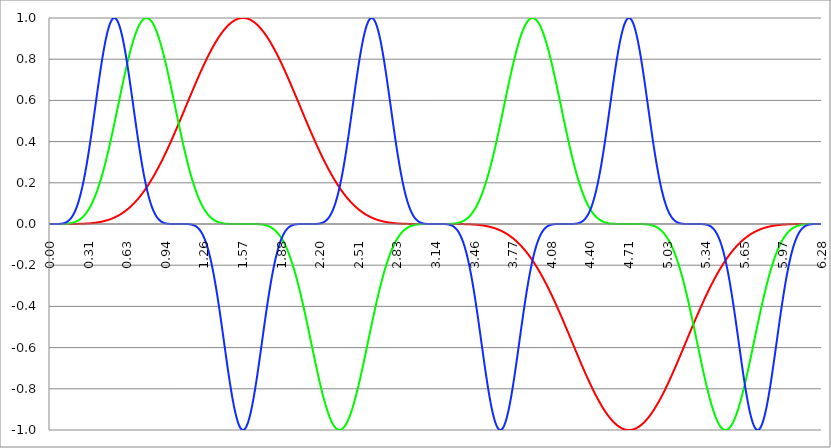
| Category | Series 1 | Series 0 | Series 2 |
|---|---|---|---|
| 0.0 | 0 | 0 | 0 |
| 0.00314159265358979 | 0 | 0 | 0 |
| 0.00628318530717958 | 0 | 0 | 0 |
| 0.00942477796076938 | 0 | 0 | 0 |
| 0.0125663706143592 | 0 | 0 | 0 |
| 0.015707963267949 | 0 | 0 | 0 |
| 0.0188495559215388 | 0 | 0 | 0 |
| 0.0219911485751285 | 0 | 0 | 0 |
| 0.0251327412287183 | 0 | 0 | 0 |
| 0.0282743338823081 | 0 | 0 | 0 |
| 0.0314159265358979 | 0 | 0 | 0 |
| 0.0345575191894877 | 0 | 0 | 0 |
| 0.0376991118430775 | 0 | 0 | 0 |
| 0.0408407044966673 | 0 | 0 | 0 |
| 0.0439822971502571 | 0 | 0 | 0 |
| 0.0471238898038469 | 0 | 0 | 0 |
| 0.0502654824574367 | 0 | 0 | 0 |
| 0.0534070751110265 | 0 | 0 | 0 |
| 0.0565486677646163 | 0 | 0 | 0 |
| 0.059690260418206 | 0 | 0 | 0 |
| 0.0628318530717958 | 0 | 0 | 0 |
| 0.0659734457253856 | 0 | 0 | 0 |
| 0.0691150383789754 | 0 | 0 | 0 |
| 0.0722566310325652 | 0 | 0 | 0 |
| 0.075398223686155 | 0 | 0 | 0.001 |
| 0.0785398163397448 | 0 | 0 | 0.001 |
| 0.0816814089933346 | 0 | 0 | 0.001 |
| 0.0848230016469244 | 0 | 0 | 0.001 |
| 0.0879645943005142 | 0 | 0 | 0.001 |
| 0.091106186954104 | 0 | 0 | 0.001 |
| 0.0942477796076937 | 0 | 0 | 0.002 |
| 0.0973893722612835 | 0 | 0 | 0.002 |
| 0.100530964914873 | 0 | 0 | 0.002 |
| 0.103672557568463 | 0 | 0 | 0.003 |
| 0.106814150222053 | 0 | 0 | 0.003 |
| 0.109955742875643 | 0 | 0 | 0.004 |
| 0.113097335529233 | 0 | 0.001 | 0.004 |
| 0.116238928182822 | 0 | 0.001 | 0.005 |
| 0.119380520836412 | 0 | 0.001 | 0.005 |
| 0.122522113490002 | 0 | 0.001 | 0.006 |
| 0.125663706143592 | 0 | 0.001 | 0.007 |
| 0.128805298797181 | 0 | 0.001 | 0.008 |
| 0.131946891450771 | 0 | 0.001 | 0.009 |
| 0.135088484104361 | 0 | 0.001 | 0.01 |
| 0.138230076757951 | 0 | 0.002 | 0.011 |
| 0.141371669411541 | 0 | 0.002 | 0.012 |
| 0.14451326206513 | 0 | 0.002 | 0.013 |
| 0.14765485471872 | 0 | 0.002 | 0.014 |
| 0.15079644737231 | 0 | 0.002 | 0.016 |
| 0.1539380400259 | 0 | 0.003 | 0.018 |
| 0.15707963267949 | 0 | 0.003 | 0.019 |
| 0.160221225333079 | 0 | 0.003 | 0.021 |
| 0.163362817986669 | 0 | 0.003 | 0.023 |
| 0.166504410640259 | 0 | 0.004 | 0.025 |
| 0.169646003293849 | 0 | 0.004 | 0.027 |
| 0.172787595947439 | 0 | 0.004 | 0.03 |
| 0.175929188601028 | 0 | 0.005 | 0.032 |
| 0.179070781254618 | 0 | 0.005 | 0.035 |
| 0.182212373908208 | 0 | 0.006 | 0.038 |
| 0.185353966561798 | 0 | 0.006 | 0.041 |
| 0.188495559215388 | 0 | 0.007 | 0.044 |
| 0.191637151868977 | 0 | 0.007 | 0.048 |
| 0.194778744522567 | 0 | 0.008 | 0.051 |
| 0.197920337176157 | 0 | 0.009 | 0.055 |
| 0.201061929829747 | 0 | 0.009 | 0.059 |
| 0.204203522483336 | 0 | 0.01 | 0.063 |
| 0.207345115136926 | 0 | 0.011 | 0.067 |
| 0.210486707790516 | 0 | 0.011 | 0.072 |
| 0.213628300444106 | 0 | 0.012 | 0.076 |
| 0.216769893097696 | 0 | 0.013 | 0.081 |
| 0.219911485751285 | 0 | 0.014 | 0.086 |
| 0.223053078404875 | 0.001 | 0.015 | 0.092 |
| 0.226194671058465 | 0.001 | 0.016 | 0.097 |
| 0.229336263712055 | 0.001 | 0.017 | 0.103 |
| 0.232477856365645 | 0.001 | 0.018 | 0.109 |
| 0.235619449019234 | 0.001 | 0.019 | 0.116 |
| 0.238761041672824 | 0.001 | 0.021 | 0.122 |
| 0.241902634326414 | 0.001 | 0.022 | 0.129 |
| 0.245044226980004 | 0.001 | 0.023 | 0.136 |
| 0.248185819633594 | 0.001 | 0.024 | 0.143 |
| 0.251327412287183 | 0.001 | 0.026 | 0.15 |
| 0.254469004940773 | 0.001 | 0.027 | 0.158 |
| 0.257610597594363 | 0.001 | 0.029 | 0.166 |
| 0.260752190247953 | 0.001 | 0.031 | 0.174 |
| 0.263893782901543 | 0.001 | 0.032 | 0.182 |
| 0.267035375555132 | 0.001 | 0.034 | 0.191 |
| 0.270176968208722 | 0.001 | 0.036 | 0.2 |
| 0.273318560862312 | 0.001 | 0.038 | 0.209 |
| 0.276460153515902 | 0.002 | 0.04 | 0.218 |
| 0.279601746169492 | 0.002 | 0.042 | 0.228 |
| 0.282743338823082 | 0.002 | 0.044 | 0.237 |
| 0.285884931476671 | 0.002 | 0.046 | 0.247 |
| 0.289026524130261 | 0.002 | 0.049 | 0.258 |
| 0.292168116783851 | 0.002 | 0.051 | 0.268 |
| 0.295309709437441 | 0.002 | 0.054 | 0.279 |
| 0.298451302091031 | 0.002 | 0.056 | 0.29 |
| 0.30159289474462 | 0.002 | 0.059 | 0.301 |
| 0.30473448739821 | 0.002 | 0.061 | 0.312 |
| 0.3078760800518 | 0.003 | 0.064 | 0.323 |
| 0.31101767270539 | 0.003 | 0.067 | 0.335 |
| 0.31415926535898 | 0.003 | 0.07 | 0.347 |
| 0.31730085801257 | 0.003 | 0.073 | 0.359 |
| 0.320442450666159 | 0.003 | 0.076 | 0.371 |
| 0.323584043319749 | 0.003 | 0.08 | 0.383 |
| 0.326725635973339 | 0.003 | 0.083 | 0.395 |
| 0.329867228626929 | 0.004 | 0.086 | 0.408 |
| 0.333008821280519 | 0.004 | 0.09 | 0.421 |
| 0.336150413934108 | 0.004 | 0.094 | 0.433 |
| 0.339292006587698 | 0.004 | 0.097 | 0.446 |
| 0.342433599241288 | 0.004 | 0.101 | 0.459 |
| 0.345575191894878 | 0.004 | 0.105 | 0.472 |
| 0.348716784548468 | 0.005 | 0.109 | 0.486 |
| 0.351858377202058 | 0.005 | 0.113 | 0.499 |
| 0.354999969855647 | 0.005 | 0.118 | 0.512 |
| 0.358141562509237 | 0.005 | 0.122 | 0.526 |
| 0.361283155162827 | 0.006 | 0.126 | 0.539 |
| 0.364424747816417 | 0.006 | 0.131 | 0.553 |
| 0.367566340470007 | 0.006 | 0.136 | 0.566 |
| 0.370707933123597 | 0.006 | 0.14 | 0.58 |
| 0.373849525777186 | 0.006 | 0.145 | 0.593 |
| 0.376991118430776 | 0.007 | 0.15 | 0.606 |
| 0.380132711084366 | 0.007 | 0.155 | 0.62 |
| 0.383274303737956 | 0.007 | 0.161 | 0.633 |
| 0.386415896391546 | 0.008 | 0.166 | 0.647 |
| 0.389557489045135 | 0.008 | 0.171 | 0.66 |
| 0.392699081698725 | 0.008 | 0.177 | 0.673 |
| 0.395840674352315 | 0.009 | 0.182 | 0.686 |
| 0.398982267005905 | 0.009 | 0.188 | 0.699 |
| 0.402123859659495 | 0.009 | 0.194 | 0.712 |
| 0.405265452313085 | 0.01 | 0.2 | 0.725 |
| 0.408407044966674 | 0.01 | 0.206 | 0.737 |
| 0.411548637620264 | 0.01 | 0.212 | 0.75 |
| 0.414690230273854 | 0.011 | 0.218 | 0.762 |
| 0.417831822927444 | 0.011 | 0.225 | 0.774 |
| 0.420973415581034 | 0.011 | 0.231 | 0.786 |
| 0.424115008234623 | 0.012 | 0.237 | 0.798 |
| 0.427256600888213 | 0.012 | 0.244 | 0.809 |
| 0.430398193541803 | 0.013 | 0.251 | 0.82 |
| 0.433539786195393 | 0.013 | 0.258 | 0.831 |
| 0.436681378848983 | 0.014 | 0.265 | 0.842 |
| 0.439822971502573 | 0.014 | 0.272 | 0.852 |
| 0.442964564156162 | 0.014 | 0.279 | 0.863 |
| 0.446106156809752 | 0.015 | 0.286 | 0.873 |
| 0.449247749463342 | 0.015 | 0.293 | 0.882 |
| 0.452389342116932 | 0.016 | 0.301 | 0.891 |
| 0.455530934770522 | 0.016 | 0.308 | 0.9 |
| 0.458672527424111 | 0.017 | 0.316 | 0.909 |
| 0.461814120077701 | 0.018 | 0.323 | 0.917 |
| 0.464955712731291 | 0.018 | 0.331 | 0.925 |
| 0.468097305384881 | 0.019 | 0.339 | 0.933 |
| 0.471238898038471 | 0.019 | 0.347 | 0.94 |
| 0.474380490692061 | 0.02 | 0.355 | 0.947 |
| 0.47752208334565 | 0.021 | 0.363 | 0.953 |
| 0.48066367599924 | 0.021 | 0.371 | 0.959 |
| 0.48380526865283 | 0.022 | 0.379 | 0.965 |
| 0.48694686130642 | 0.022 | 0.387 | 0.97 |
| 0.49008845396001 | 0.023 | 0.395 | 0.975 |
| 0.493230046613599 | 0.024 | 0.404 | 0.979 |
| 0.496371639267189 | 0.024 | 0.412 | 0.983 |
| 0.499513231920779 | 0.025 | 0.421 | 0.987 |
| 0.502654824574369 | 0.026 | 0.429 | 0.99 |
| 0.505796417227959 | 0.027 | 0.438 | 0.993 |
| 0.508938009881549 | 0.027 | 0.446 | 0.995 |
| 0.512079602535138 | 0.028 | 0.455 | 0.997 |
| 0.515221195188728 | 0.029 | 0.464 | 0.998 |
| 0.518362787842318 | 0.03 | 0.472 | 0.999 |
| 0.521504380495908 | 0.031 | 0.481 | 1 |
| 0.524645973149498 | 0.032 | 0.49 | 1 |
| 0.527787565803087 | 0.032 | 0.499 | 1 |
| 0.530929158456677 | 0.033 | 0.508 | 0.999 |
| 0.534070751110267 | 0.034 | 0.517 | 0.998 |
| 0.537212343763857 | 0.035 | 0.526 | 0.996 |
| 0.540353936417447 | 0.036 | 0.535 | 0.994 |
| 0.543495529071037 | 0.037 | 0.544 | 0.991 |
| 0.546637121724626 | 0.038 | 0.553 | 0.988 |
| 0.549778714378216 | 0.039 | 0.562 | 0.985 |
| 0.552920307031806 | 0.04 | 0.571 | 0.981 |
| 0.556061899685396 | 0.041 | 0.58 | 0.977 |
| 0.559203492338986 | 0.042 | 0.589 | 0.972 |
| 0.562345084992576 | 0.043 | 0.598 | 0.967 |
| 0.565486677646165 | 0.044 | 0.606 | 0.961 |
| 0.568628270299755 | 0.045 | 0.615 | 0.955 |
| 0.571769862953345 | 0.046 | 0.624 | 0.949 |
| 0.574911455606935 | 0.048 | 0.633 | 0.942 |
| 0.578053048260525 | 0.049 | 0.642 | 0.935 |
| 0.581194640914114 | 0.05 | 0.651 | 0.928 |
| 0.584336233567704 | 0.051 | 0.66 | 0.92 |
| 0.587477826221294 | 0.052 | 0.669 | 0.912 |
| 0.590619418874884 | 0.054 | 0.677 | 0.903 |
| 0.593761011528474 | 0.055 | 0.686 | 0.894 |
| 0.596902604182064 | 0.056 | 0.695 | 0.885 |
| 0.600044196835653 | 0.057 | 0.703 | 0.876 |
| 0.603185789489243 | 0.059 | 0.712 | 0.866 |
| 0.606327382142833 | 0.06 | 0.721 | 0.856 |
| 0.609468974796423 | 0.061 | 0.729 | 0.846 |
| 0.612610567450013 | 0.063 | 0.737 | 0.835 |
| 0.615752160103602 | 0.064 | 0.746 | 0.824 |
| 0.618893752757192 | 0.066 | 0.754 | 0.813 |
| 0.622035345410782 | 0.067 | 0.762 | 0.802 |
| 0.625176938064372 | 0.069 | 0.77 | 0.79 |
| 0.628318530717962 | 0.07 | 0.778 | 0.778 |
| 0.631460123371551 | 0.072 | 0.786 | 0.766 |
| 0.634601716025141 | 0.073 | 0.794 | 0.754 |
| 0.637743308678731 | 0.075 | 0.802 | 0.742 |
| 0.640884901332321 | 0.076 | 0.809 | 0.729 |
| 0.644026493985911 | 0.078 | 0.817 | 0.716 |
| 0.647168086639501 | 0.08 | 0.824 | 0.703 |
| 0.65030967929309 | 0.081 | 0.831 | 0.691 |
| 0.65345127194668 | 0.083 | 0.838 | 0.677 |
| 0.65659286460027 | 0.085 | 0.846 | 0.664 |
| 0.65973445725386 | 0.086 | 0.852 | 0.651 |
| 0.66287604990745 | 0.088 | 0.859 | 0.638 |
| 0.666017642561039 | 0.09 | 0.866 | 0.624 |
| 0.669159235214629 | 0.092 | 0.873 | 0.611 |
| 0.672300827868219 | 0.094 | 0.879 | 0.598 |
| 0.675442420521809 | 0.096 | 0.885 | 0.584 |
| 0.678584013175399 | 0.097 | 0.891 | 0.571 |
| 0.681725605828989 | 0.099 | 0.897 | 0.557 |
| 0.684867198482578 | 0.101 | 0.903 | 0.544 |
| 0.688008791136168 | 0.103 | 0.909 | 0.53 |
| 0.691150383789758 | 0.105 | 0.915 | 0.517 |
| 0.694291976443348 | 0.107 | 0.92 | 0.503 |
| 0.697433569096938 | 0.109 | 0.925 | 0.49 |
| 0.700575161750528 | 0.111 | 0.93 | 0.477 |
| 0.703716754404117 | 0.113 | 0.935 | 0.464 |
| 0.706858347057707 | 0.116 | 0.94 | 0.451 |
| 0.709999939711297 | 0.118 | 0.945 | 0.438 |
| 0.713141532364887 | 0.12 | 0.949 | 0.425 |
| 0.716283125018477 | 0.122 | 0.953 | 0.412 |
| 0.719424717672066 | 0.124 | 0.957 | 0.399 |
| 0.722566310325656 | 0.126 | 0.961 | 0.387 |
| 0.725707902979246 | 0.129 | 0.965 | 0.375 |
| 0.728849495632836 | 0.131 | 0.968 | 0.363 |
| 0.731991088286426 | 0.133 | 0.972 | 0.351 |
| 0.735132680940016 | 0.136 | 0.975 | 0.339 |
| 0.738274273593605 | 0.138 | 0.978 | 0.327 |
| 0.741415866247195 | 0.14 | 0.981 | 0.316 |
| 0.744557458900785 | 0.143 | 0.983 | 0.304 |
| 0.747699051554375 | 0.145 | 0.986 | 0.293 |
| 0.750840644207965 | 0.148 | 0.988 | 0.282 |
| 0.753982236861554 | 0.15 | 0.99 | 0.272 |
| 0.757123829515144 | 0.153 | 0.992 | 0.261 |
| 0.760265422168734 | 0.155 | 0.994 | 0.251 |
| 0.763407014822324 | 0.158 | 0.995 | 0.241 |
| 0.766548607475914 | 0.161 | 0.996 | 0.231 |
| 0.769690200129504 | 0.163 | 0.998 | 0.221 |
| 0.772831792783093 | 0.166 | 0.998 | 0.212 |
| 0.775973385436683 | 0.169 | 0.999 | 0.203 |
| 0.779114978090273 | 0.171 | 1 | 0.194 |
| 0.782256570743863 | 0.174 | 1 | 0.185 |
| 0.785398163397453 | 0.177 | 1 | 0.177 |
| 0.788539756051042 | 0.18 | 1 | 0.169 |
| 0.791681348704632 | 0.182 | 1 | 0.161 |
| 0.794822941358222 | 0.185 | 0.999 | 0.153 |
| 0.797964534011812 | 0.188 | 0.998 | 0.145 |
| 0.801106126665402 | 0.191 | 0.998 | 0.138 |
| 0.804247719318992 | 0.194 | 0.996 | 0.131 |
| 0.807389311972581 | 0.197 | 0.995 | 0.124 |
| 0.810530904626171 | 0.2 | 0.994 | 0.118 |
| 0.813672497279761 | 0.203 | 0.992 | 0.111 |
| 0.816814089933351 | 0.206 | 0.99 | 0.105 |
| 0.819955682586941 | 0.209 | 0.988 | 0.099 |
| 0.823097275240531 | 0.212 | 0.986 | 0.094 |
| 0.82623886789412 | 0.215 | 0.983 | 0.088 |
| 0.82938046054771 | 0.218 | 0.981 | 0.083 |
| 0.8325220532013 | 0.221 | 0.978 | 0.078 |
| 0.83566364585489 | 0.225 | 0.975 | 0.073 |
| 0.83880523850848 | 0.228 | 0.972 | 0.069 |
| 0.841946831162069 | 0.231 | 0.968 | 0.064 |
| 0.845088423815659 | 0.234 | 0.965 | 0.06 |
| 0.848230016469249 | 0.237 | 0.961 | 0.056 |
| 0.851371609122839 | 0.241 | 0.957 | 0.052 |
| 0.854513201776429 | 0.244 | 0.953 | 0.049 |
| 0.857654794430019 | 0.247 | 0.949 | 0.045 |
| 0.860796387083608 | 0.251 | 0.945 | 0.042 |
| 0.863937979737198 | 0.254 | 0.94 | 0.039 |
| 0.867079572390788 | 0.258 | 0.935 | 0.036 |
| 0.870221165044378 | 0.261 | 0.93 | 0.033 |
| 0.873362757697968 | 0.265 | 0.925 | 0.031 |
| 0.876504350351557 | 0.268 | 0.92 | 0.028 |
| 0.879645943005147 | 0.272 | 0.915 | 0.026 |
| 0.882787535658737 | 0.275 | 0.909 | 0.024 |
| 0.885929128312327 | 0.279 | 0.903 | 0.022 |
| 0.889070720965917 | 0.282 | 0.897 | 0.02 |
| 0.892212313619507 | 0.286 | 0.891 | 0.018 |
| 0.895353906273096 | 0.29 | 0.885 | 0.016 |
| 0.898495498926686 | 0.293 | 0.879 | 0.015 |
| 0.901637091580276 | 0.297 | 0.873 | 0.014 |
| 0.904778684233866 | 0.301 | 0.866 | 0.012 |
| 0.907920276887456 | 0.304 | 0.859 | 0.011 |
| 0.911061869541045 | 0.308 | 0.852 | 0.01 |
| 0.914203462194635 | 0.312 | 0.846 | 0.009 |
| 0.917345054848225 | 0.316 | 0.838 | 0.008 |
| 0.920486647501815 | 0.319 | 0.831 | 0.007 |
| 0.923628240155405 | 0.323 | 0.824 | 0.006 |
| 0.926769832808995 | 0.327 | 0.817 | 0.006 |
| 0.929911425462584 | 0.331 | 0.809 | 0.005 |
| 0.933053018116174 | 0.335 | 0.802 | 0.004 |
| 0.936194610769764 | 0.339 | 0.794 | 0.004 |
| 0.939336203423354 | 0.343 | 0.786 | 0.003 |
| 0.942477796076944 | 0.347 | 0.778 | 0.003 |
| 0.945619388730533 | 0.351 | 0.77 | 0.002 |
| 0.948760981384123 | 0.355 | 0.762 | 0.002 |
| 0.951902574037713 | 0.359 | 0.754 | 0.002 |
| 0.955044166691303 | 0.363 | 0.746 | 0.002 |
| 0.958185759344893 | 0.367 | 0.737 | 0.001 |
| 0.961327351998483 | 0.371 | 0.729 | 0.001 |
| 0.964468944652072 | 0.375 | 0.721 | 0.001 |
| 0.967610537305662 | 0.379 | 0.712 | 0.001 |
| 0.970752129959252 | 0.383 | 0.703 | 0.001 |
| 0.973893722612842 | 0.387 | 0.695 | 0 |
| 0.977035315266432 | 0.391 | 0.686 | 0 |
| 0.980176907920022 | 0.395 | 0.677 | 0 |
| 0.983318500573611 | 0.399 | 0.669 | 0 |
| 0.986460093227201 | 0.404 | 0.66 | 0 |
| 0.989601685880791 | 0.408 | 0.651 | 0 |
| 0.992743278534381 | 0.412 | 0.642 | 0 |
| 0.995884871187971 | 0.416 | 0.633 | 0 |
| 0.99902646384156 | 0.421 | 0.624 | 0 |
| 1.00216805649515 | 0.425 | 0.615 | 0 |
| 1.00530964914874 | 0.429 | 0.606 | 0 |
| 1.00845124180233 | 0.433 | 0.598 | 0 |
| 1.01159283445592 | 0.438 | 0.589 | 0 |
| 1.01473442710951 | 0.442 | 0.58 | 0 |
| 1.017876019763099 | 0.446 | 0.571 | 0 |
| 1.021017612416689 | 0.451 | 0.562 | 0 |
| 1.02415920507028 | 0.455 | 0.553 | 0 |
| 1.027300797723869 | 0.459 | 0.544 | 0 |
| 1.030442390377459 | 0.464 | 0.535 | 0 |
| 1.033583983031048 | 0.468 | 0.526 | 0 |
| 1.036725575684638 | 0.472 | 0.517 | 0 |
| 1.039867168338228 | 0.477 | 0.508 | 0 |
| 1.043008760991818 | 0.481 | 0.499 | 0 |
| 1.046150353645408 | 0.486 | 0.49 | 0 |
| 1.049291946298998 | 0.49 | 0.481 | 0 |
| 1.052433538952587 | 0.495 | 0.472 | 0 |
| 1.055575131606177 | 0.499 | 0.464 | 0 |
| 1.058716724259767 | 0.503 | 0.455 | 0 |
| 1.061858316913357 | 0.508 | 0.446 | 0 |
| 1.064999909566947 | 0.512 | 0.438 | 0 |
| 1.068141502220536 | 0.517 | 0.429 | 0 |
| 1.071283094874126 | 0.521 | 0.421 | 0 |
| 1.074424687527716 | 0.526 | 0.412 | 0 |
| 1.077566280181306 | 0.53 | 0.404 | 0 |
| 1.080707872834896 | 0.535 | 0.395 | 0 |
| 1.083849465488486 | 0.539 | 0.387 | 0 |
| 1.086991058142075 | 0.544 | 0.379 | 0 |
| 1.090132650795665 | 0.548 | 0.371 | 0 |
| 1.093274243449255 | 0.553 | 0.363 | 0 |
| 1.096415836102845 | 0.557 | 0.355 | 0 |
| 1.099557428756435 | 0.562 | 0.347 | 0 |
| 1.102699021410025 | 0.566 | 0.339 | 0 |
| 1.105840614063614 | 0.571 | 0.331 | 0 |
| 1.108982206717204 | 0.575 | 0.323 | 0 |
| 1.112123799370794 | 0.58 | 0.316 | 0 |
| 1.115265392024384 | 0.584 | 0.308 | 0 |
| 1.118406984677974 | 0.589 | 0.301 | 0 |
| 1.121548577331563 | 0.593 | 0.293 | -0.001 |
| 1.124690169985153 | 0.598 | 0.286 | -0.001 |
| 1.127831762638743 | 0.602 | 0.279 | -0.001 |
| 1.130973355292333 | 0.606 | 0.272 | -0.001 |
| 1.134114947945923 | 0.611 | 0.265 | -0.001 |
| 1.137256540599513 | 0.615 | 0.258 | -0.001 |
| 1.140398133253102 | 0.62 | 0.251 | -0.002 |
| 1.143539725906692 | 0.624 | 0.244 | -0.002 |
| 1.146681318560282 | 0.629 | 0.237 | -0.002 |
| 1.149822911213872 | 0.633 | 0.231 | -0.003 |
| 1.152964503867462 | 0.638 | 0.225 | -0.003 |
| 1.156106096521051 | 0.642 | 0.218 | -0.003 |
| 1.159247689174641 | 0.647 | 0.212 | -0.004 |
| 1.162389281828231 | 0.651 | 0.206 | -0.004 |
| 1.165530874481821 | 0.655 | 0.2 | -0.005 |
| 1.168672467135411 | 0.66 | 0.194 | -0.006 |
| 1.171814059789001 | 0.664 | 0.188 | -0.006 |
| 1.17495565244259 | 0.669 | 0.182 | -0.007 |
| 1.17809724509618 | 0.673 | 0.177 | -0.008 |
| 1.18123883774977 | 0.677 | 0.171 | -0.009 |
| 1.18438043040336 | 0.682 | 0.166 | -0.01 |
| 1.18752202305695 | 0.686 | 0.161 | -0.011 |
| 1.190663615710539 | 0.691 | 0.155 | -0.013 |
| 1.193805208364129 | 0.695 | 0.15 | -0.014 |
| 1.19694680101772 | 0.699 | 0.145 | -0.015 |
| 1.200088393671309 | 0.703 | 0.14 | -0.017 |
| 1.203229986324899 | 0.708 | 0.136 | -0.019 |
| 1.206371578978489 | 0.712 | 0.131 | -0.021 |
| 1.209513171632078 | 0.716 | 0.126 | -0.022 |
| 1.212654764285668 | 0.721 | 0.122 | -0.024 |
| 1.215796356939258 | 0.725 | 0.118 | -0.027 |
| 1.218937949592848 | 0.729 | 0.113 | -0.029 |
| 1.222079542246438 | 0.733 | 0.109 | -0.032 |
| 1.225221134900027 | 0.737 | 0.105 | -0.034 |
| 1.228362727553617 | 0.742 | 0.101 | -0.037 |
| 1.231504320207207 | 0.746 | 0.097 | -0.04 |
| 1.234645912860797 | 0.75 | 0.094 | -0.043 |
| 1.237787505514387 | 0.754 | 0.09 | -0.046 |
| 1.240929098167977 | 0.758 | 0.086 | -0.05 |
| 1.244070690821566 | 0.762 | 0.083 | -0.054 |
| 1.247212283475156 | 0.766 | 0.08 | -0.057 |
| 1.250353876128746 | 0.77 | 0.076 | -0.061 |
| 1.253495468782336 | 0.774 | 0.073 | -0.066 |
| 1.256637061435926 | 0.778 | 0.07 | -0.07 |
| 1.259778654089515 | 0.782 | 0.067 | -0.075 |
| 1.262920246743105 | 0.786 | 0.064 | -0.08 |
| 1.266061839396695 | 0.79 | 0.061 | -0.085 |
| 1.269203432050285 | 0.794 | 0.059 | -0.09 |
| 1.272345024703875 | 0.798 | 0.056 | -0.096 |
| 1.275486617357465 | 0.802 | 0.054 | -0.101 |
| 1.278628210011054 | 0.805 | 0.051 | -0.107 |
| 1.281769802664644 | 0.809 | 0.049 | -0.113 |
| 1.284911395318234 | 0.813 | 0.046 | -0.12 |
| 1.288052987971824 | 0.817 | 0.044 | -0.126 |
| 1.291194580625414 | 0.82 | 0.042 | -0.133 |
| 1.294336173279003 | 0.824 | 0.04 | -0.14 |
| 1.297477765932593 | 0.828 | 0.038 | -0.148 |
| 1.300619358586183 | 0.831 | 0.036 | -0.155 |
| 1.303760951239773 | 0.835 | 0.034 | -0.163 |
| 1.306902543893363 | 0.838 | 0.032 | -0.171 |
| 1.310044136546953 | 0.842 | 0.031 | -0.18 |
| 1.313185729200542 | 0.846 | 0.029 | -0.188 |
| 1.316327321854132 | 0.849 | 0.027 | -0.197 |
| 1.319468914507722 | 0.852 | 0.026 | -0.206 |
| 1.322610507161312 | 0.856 | 0.024 | -0.215 |
| 1.325752099814902 | 0.859 | 0.023 | -0.225 |
| 1.328893692468491 | 0.863 | 0.022 | -0.234 |
| 1.332035285122081 | 0.866 | 0.021 | -0.244 |
| 1.335176877775671 | 0.869 | 0.019 | -0.254 |
| 1.338318470429261 | 0.873 | 0.018 | -0.265 |
| 1.341460063082851 | 0.876 | 0.017 | -0.275 |
| 1.344601655736441 | 0.879 | 0.016 | -0.286 |
| 1.34774324839003 | 0.882 | 0.015 | -0.297 |
| 1.35088484104362 | 0.885 | 0.014 | -0.308 |
| 1.35402643369721 | 0.888 | 0.013 | -0.319 |
| 1.3571680263508 | 0.891 | 0.012 | -0.331 |
| 1.36030961900439 | 0.894 | 0.011 | -0.343 |
| 1.363451211657979 | 0.897 | 0.011 | -0.355 |
| 1.36659280431157 | 0.9 | 0.01 | -0.367 |
| 1.369734396965159 | 0.903 | 0.009 | -0.379 |
| 1.372875989618749 | 0.906 | 0.009 | -0.391 |
| 1.376017582272339 | 0.909 | 0.008 | -0.404 |
| 1.379159174925929 | 0.912 | 0.007 | -0.416 |
| 1.382300767579518 | 0.915 | 0.007 | -0.429 |
| 1.385442360233108 | 0.917 | 0.006 | -0.442 |
| 1.388583952886698 | 0.92 | 0.006 | -0.455 |
| 1.391725545540288 | 0.923 | 0.005 | -0.468 |
| 1.394867138193878 | 0.925 | 0.005 | -0.481 |
| 1.398008730847468 | 0.928 | 0.004 | -0.495 |
| 1.401150323501057 | 0.93 | 0.004 | -0.508 |
| 1.404291916154647 | 0.933 | 0.004 | -0.521 |
| 1.407433508808237 | 0.935 | 0.003 | -0.535 |
| 1.410575101461827 | 0.938 | 0.003 | -0.548 |
| 1.413716694115417 | 0.94 | 0.003 | -0.562 |
| 1.416858286769006 | 0.942 | 0.003 | -0.575 |
| 1.419999879422596 | 0.945 | 0.002 | -0.589 |
| 1.423141472076186 | 0.947 | 0.002 | -0.602 |
| 1.426283064729776 | 0.949 | 0.002 | -0.615 |
| 1.429424657383366 | 0.951 | 0.002 | -0.629 |
| 1.432566250036956 | 0.953 | 0.002 | -0.642 |
| 1.435707842690545 | 0.955 | 0.001 | -0.655 |
| 1.438849435344135 | 0.957 | 0.001 | -0.669 |
| 1.441991027997725 | 0.959 | 0.001 | -0.682 |
| 1.445132620651315 | 0.961 | 0.001 | -0.695 |
| 1.448274213304905 | 0.963 | 0.001 | -0.708 |
| 1.451415805958494 | 0.965 | 0.001 | -0.721 |
| 1.454557398612084 | 0.967 | 0.001 | -0.733 |
| 1.457698991265674 | 0.968 | 0.001 | -0.746 |
| 1.460840583919264 | 0.97 | 0 | -0.758 |
| 1.463982176572854 | 0.972 | 0 | -0.77 |
| 1.467123769226444 | 0.973 | 0 | -0.782 |
| 1.470265361880033 | 0.975 | 0 | -0.794 |
| 1.473406954533623 | 0.977 | 0 | -0.805 |
| 1.476548547187213 | 0.978 | 0 | -0.817 |
| 1.479690139840803 | 0.979 | 0 | -0.828 |
| 1.482831732494393 | 0.981 | 0 | -0.838 |
| 1.485973325147982 | 0.982 | 0 | -0.849 |
| 1.489114917801572 | 0.983 | 0 | -0.859 |
| 1.492256510455162 | 0.985 | 0 | -0.869 |
| 1.495398103108752 | 0.986 | 0 | -0.879 |
| 1.498539695762342 | 0.987 | 0 | -0.888 |
| 1.501681288415932 | 0.988 | 0 | -0.897 |
| 1.504822881069521 | 0.989 | 0 | -0.906 |
| 1.507964473723111 | 0.99 | 0 | -0.915 |
| 1.511106066376701 | 0.991 | 0 | -0.923 |
| 1.514247659030291 | 0.992 | 0 | -0.93 |
| 1.517389251683881 | 0.993 | 0 | -0.938 |
| 1.520530844337471 | 0.994 | 0 | -0.945 |
| 1.52367243699106 | 0.994 | 0 | -0.951 |
| 1.52681402964465 | 0.995 | 0 | -0.957 |
| 1.52995562229824 | 0.996 | 0 | -0.963 |
| 1.53309721495183 | 0.996 | 0 | -0.968 |
| 1.53623880760542 | 0.997 | 0 | -0.973 |
| 1.539380400259009 | 0.998 | 0 | -0.978 |
| 1.542521992912599 | 0.998 | 0 | -0.982 |
| 1.545663585566189 | 0.998 | 0 | -0.986 |
| 1.548805178219779 | 0.999 | 0 | -0.989 |
| 1.551946770873369 | 0.999 | 0 | -0.992 |
| 1.555088363526959 | 0.999 | 0 | -0.994 |
| 1.558229956180548 | 1 | 0 | -0.996 |
| 1.561371548834138 | 1 | 0 | -0.998 |
| 1.564513141487728 | 1 | 0 | -0.999 |
| 1.567654734141318 | 1 | 0 | -1 |
| 1.570796326794908 | 1 | 0 | -1 |
| 1.573937919448497 | 1 | 0 | -1 |
| 1.577079512102087 | 1 | 0 | -0.999 |
| 1.580221104755677 | 1 | 0 | -0.998 |
| 1.583362697409267 | 1 | 0 | -0.996 |
| 1.586504290062857 | 0.999 | 0 | -0.994 |
| 1.589645882716447 | 0.999 | 0 | -0.992 |
| 1.592787475370036 | 0.999 | 0 | -0.989 |
| 1.595929068023626 | 0.998 | 0 | -0.986 |
| 1.599070660677216 | 0.998 | 0 | -0.982 |
| 1.602212253330806 | 0.998 | 0 | -0.978 |
| 1.605353845984396 | 0.997 | 0 | -0.973 |
| 1.608495438637985 | 0.996 | 0 | -0.968 |
| 1.611637031291575 | 0.996 | 0 | -0.963 |
| 1.614778623945165 | 0.995 | 0 | -0.957 |
| 1.617920216598755 | 0.994 | 0 | -0.951 |
| 1.621061809252345 | 0.994 | 0 | -0.945 |
| 1.624203401905935 | 0.993 | 0 | -0.938 |
| 1.627344994559524 | 0.992 | 0 | -0.93 |
| 1.630486587213114 | 0.991 | 0 | -0.923 |
| 1.633628179866704 | 0.99 | 0 | -0.915 |
| 1.636769772520294 | 0.989 | 0 | -0.906 |
| 1.639911365173884 | 0.988 | 0 | -0.897 |
| 1.643052957827473 | 0.987 | 0 | -0.888 |
| 1.646194550481063 | 0.986 | 0 | -0.879 |
| 1.649336143134653 | 0.985 | 0 | -0.869 |
| 1.652477735788243 | 0.983 | 0 | -0.859 |
| 1.655619328441833 | 0.982 | 0 | -0.849 |
| 1.658760921095423 | 0.981 | 0 | -0.838 |
| 1.661902513749012 | 0.979 | 0 | -0.828 |
| 1.665044106402602 | 0.978 | 0 | -0.817 |
| 1.668185699056192 | 0.977 | 0 | -0.805 |
| 1.671327291709782 | 0.975 | 0 | -0.794 |
| 1.674468884363372 | 0.973 | 0 | -0.782 |
| 1.677610477016961 | 0.972 | 0 | -0.77 |
| 1.680752069670551 | 0.97 | 0 | -0.758 |
| 1.683893662324141 | 0.968 | -0.001 | -0.746 |
| 1.687035254977731 | 0.967 | -0.001 | -0.733 |
| 1.690176847631321 | 0.965 | -0.001 | -0.721 |
| 1.693318440284911 | 0.963 | -0.001 | -0.708 |
| 1.6964600329385 | 0.961 | -0.001 | -0.695 |
| 1.69960162559209 | 0.959 | -0.001 | -0.682 |
| 1.70274321824568 | 0.957 | -0.001 | -0.669 |
| 1.70588481089927 | 0.955 | -0.001 | -0.655 |
| 1.70902640355286 | 0.953 | -0.002 | -0.642 |
| 1.712167996206449 | 0.951 | -0.002 | -0.629 |
| 1.715309588860039 | 0.949 | -0.002 | -0.615 |
| 1.71845118151363 | 0.947 | -0.002 | -0.602 |
| 1.721592774167219 | 0.945 | -0.002 | -0.589 |
| 1.724734366820809 | 0.942 | -0.003 | -0.575 |
| 1.727875959474399 | 0.94 | -0.003 | -0.562 |
| 1.731017552127988 | 0.938 | -0.003 | -0.548 |
| 1.734159144781578 | 0.935 | -0.003 | -0.535 |
| 1.737300737435168 | 0.933 | -0.004 | -0.521 |
| 1.740442330088758 | 0.93 | -0.004 | -0.508 |
| 1.743583922742348 | 0.928 | -0.004 | -0.495 |
| 1.746725515395937 | 0.925 | -0.005 | -0.481 |
| 1.749867108049527 | 0.923 | -0.005 | -0.468 |
| 1.753008700703117 | 0.92 | -0.006 | -0.455 |
| 1.756150293356707 | 0.917 | -0.006 | -0.442 |
| 1.759291886010297 | 0.915 | -0.007 | -0.429 |
| 1.762433478663887 | 0.912 | -0.007 | -0.416 |
| 1.765575071317476 | 0.909 | -0.008 | -0.404 |
| 1.768716663971066 | 0.906 | -0.009 | -0.391 |
| 1.771858256624656 | 0.903 | -0.009 | -0.379 |
| 1.774999849278246 | 0.9 | -0.01 | -0.367 |
| 1.778141441931836 | 0.897 | -0.011 | -0.355 |
| 1.781283034585426 | 0.894 | -0.011 | -0.343 |
| 1.784424627239015 | 0.891 | -0.012 | -0.331 |
| 1.787566219892605 | 0.888 | -0.013 | -0.319 |
| 1.790707812546195 | 0.885 | -0.014 | -0.308 |
| 1.793849405199785 | 0.882 | -0.015 | -0.297 |
| 1.796990997853375 | 0.879 | -0.016 | -0.286 |
| 1.800132590506964 | 0.876 | -0.017 | -0.275 |
| 1.803274183160554 | 0.873 | -0.018 | -0.265 |
| 1.806415775814144 | 0.869 | -0.019 | -0.254 |
| 1.809557368467734 | 0.866 | -0.021 | -0.244 |
| 1.812698961121324 | 0.863 | -0.022 | -0.234 |
| 1.815840553774914 | 0.859 | -0.023 | -0.225 |
| 1.818982146428503 | 0.856 | -0.024 | -0.215 |
| 1.822123739082093 | 0.852 | -0.026 | -0.206 |
| 1.825265331735683 | 0.849 | -0.027 | -0.197 |
| 1.828406924389273 | 0.846 | -0.029 | -0.188 |
| 1.831548517042863 | 0.842 | -0.031 | -0.18 |
| 1.834690109696452 | 0.838 | -0.032 | -0.171 |
| 1.837831702350042 | 0.835 | -0.034 | -0.163 |
| 1.840973295003632 | 0.831 | -0.036 | -0.155 |
| 1.844114887657222 | 0.828 | -0.038 | -0.148 |
| 1.847256480310812 | 0.824 | -0.04 | -0.14 |
| 1.850398072964402 | 0.82 | -0.042 | -0.133 |
| 1.853539665617991 | 0.817 | -0.044 | -0.126 |
| 1.856681258271581 | 0.813 | -0.046 | -0.12 |
| 1.859822850925171 | 0.809 | -0.049 | -0.113 |
| 1.862964443578761 | 0.805 | -0.051 | -0.107 |
| 1.866106036232351 | 0.802 | -0.054 | -0.101 |
| 1.86924762888594 | 0.798 | -0.056 | -0.096 |
| 1.87238922153953 | 0.794 | -0.059 | -0.09 |
| 1.87553081419312 | 0.79 | -0.061 | -0.085 |
| 1.87867240684671 | 0.786 | -0.064 | -0.08 |
| 1.8818139995003 | 0.782 | -0.067 | -0.075 |
| 1.88495559215389 | 0.778 | -0.07 | -0.07 |
| 1.888097184807479 | 0.774 | -0.073 | -0.066 |
| 1.891238777461069 | 0.77 | -0.076 | -0.061 |
| 1.89438037011466 | 0.766 | -0.08 | -0.057 |
| 1.897521962768249 | 0.762 | -0.083 | -0.054 |
| 1.900663555421839 | 0.758 | -0.086 | -0.05 |
| 1.903805148075429 | 0.754 | -0.09 | -0.046 |
| 1.906946740729018 | 0.75 | -0.094 | -0.043 |
| 1.910088333382608 | 0.746 | -0.097 | -0.04 |
| 1.913229926036198 | 0.742 | -0.101 | -0.037 |
| 1.916371518689788 | 0.737 | -0.105 | -0.034 |
| 1.919513111343378 | 0.733 | -0.109 | -0.032 |
| 1.922654703996967 | 0.729 | -0.113 | -0.029 |
| 1.925796296650557 | 0.725 | -0.118 | -0.027 |
| 1.928937889304147 | 0.721 | -0.122 | -0.024 |
| 1.932079481957737 | 0.716 | -0.126 | -0.022 |
| 1.935221074611327 | 0.712 | -0.131 | -0.021 |
| 1.938362667264917 | 0.708 | -0.136 | -0.019 |
| 1.941504259918506 | 0.703 | -0.14 | -0.017 |
| 1.944645852572096 | 0.699 | -0.145 | -0.015 |
| 1.947787445225686 | 0.695 | -0.15 | -0.014 |
| 1.950929037879276 | 0.691 | -0.155 | -0.013 |
| 1.954070630532866 | 0.686 | -0.161 | -0.011 |
| 1.957212223186455 | 0.682 | -0.166 | -0.01 |
| 1.960353815840045 | 0.677 | -0.171 | -0.009 |
| 1.963495408493635 | 0.673 | -0.177 | -0.008 |
| 1.966637001147225 | 0.669 | -0.182 | -0.007 |
| 1.969778593800815 | 0.664 | -0.188 | -0.006 |
| 1.972920186454405 | 0.66 | -0.194 | -0.006 |
| 1.976061779107994 | 0.655 | -0.2 | -0.005 |
| 1.979203371761584 | 0.651 | -0.206 | -0.004 |
| 1.982344964415174 | 0.647 | -0.212 | -0.004 |
| 1.985486557068764 | 0.642 | -0.218 | -0.003 |
| 1.988628149722354 | 0.638 | -0.225 | -0.003 |
| 1.991769742375943 | 0.633 | -0.231 | -0.003 |
| 1.994911335029533 | 0.629 | -0.237 | -0.002 |
| 1.998052927683123 | 0.624 | -0.244 | -0.002 |
| 2.001194520336712 | 0.62 | -0.251 | -0.002 |
| 2.004336112990302 | 0.615 | -0.258 | -0.001 |
| 2.007477705643892 | 0.611 | -0.265 | -0.001 |
| 2.010619298297482 | 0.606 | -0.272 | -0.001 |
| 2.013760890951071 | 0.602 | -0.279 | -0.001 |
| 2.016902483604661 | 0.598 | -0.286 | -0.001 |
| 2.02004407625825 | 0.593 | -0.293 | -0.001 |
| 2.02318566891184 | 0.589 | -0.301 | 0 |
| 2.02632726156543 | 0.584 | -0.308 | 0 |
| 2.029468854219019 | 0.58 | -0.316 | 0 |
| 2.032610446872609 | 0.575 | -0.323 | 0 |
| 2.035752039526198 | 0.571 | -0.331 | 0 |
| 2.038893632179788 | 0.566 | -0.339 | 0 |
| 2.042035224833378 | 0.562 | -0.347 | 0 |
| 2.045176817486967 | 0.557 | -0.355 | 0 |
| 2.048318410140557 | 0.553 | -0.363 | 0 |
| 2.051460002794146 | 0.548 | -0.371 | 0 |
| 2.054601595447736 | 0.544 | -0.379 | 0 |
| 2.057743188101325 | 0.539 | -0.387 | 0 |
| 2.060884780754915 | 0.535 | -0.395 | 0 |
| 2.064026373408505 | 0.53 | -0.404 | 0 |
| 2.067167966062094 | 0.526 | -0.412 | 0 |
| 2.070309558715684 | 0.521 | -0.421 | 0 |
| 2.073451151369273 | 0.517 | -0.429 | 0 |
| 2.076592744022863 | 0.512 | -0.438 | 0 |
| 2.079734336676452 | 0.508 | -0.446 | 0 |
| 2.082875929330042 | 0.503 | -0.455 | 0 |
| 2.086017521983632 | 0.499 | -0.464 | 0 |
| 2.089159114637221 | 0.495 | -0.472 | 0 |
| 2.092300707290811 | 0.49 | -0.481 | 0 |
| 2.095442299944401 | 0.486 | -0.49 | 0 |
| 2.09858389259799 | 0.481 | -0.499 | 0 |
| 2.10172548525158 | 0.477 | -0.508 | 0 |
| 2.104867077905169 | 0.472 | -0.517 | 0 |
| 2.108008670558759 | 0.468 | -0.526 | 0 |
| 2.111150263212349 | 0.464 | -0.535 | 0 |
| 2.114291855865938 | 0.459 | -0.544 | 0 |
| 2.117433448519528 | 0.455 | -0.553 | 0 |
| 2.120575041173117 | 0.451 | -0.562 | 0 |
| 2.123716633826707 | 0.446 | -0.571 | 0 |
| 2.126858226480297 | 0.442 | -0.58 | 0 |
| 2.129999819133886 | 0.438 | -0.589 | 0 |
| 2.133141411787476 | 0.433 | -0.598 | 0 |
| 2.136283004441065 | 0.429 | -0.606 | 0 |
| 2.139424597094655 | 0.425 | -0.615 | 0 |
| 2.142566189748245 | 0.421 | -0.624 | 0 |
| 2.145707782401834 | 0.416 | -0.633 | 0 |
| 2.148849375055424 | 0.412 | -0.642 | 0 |
| 2.151990967709013 | 0.408 | -0.651 | 0 |
| 2.155132560362603 | 0.404 | -0.66 | 0 |
| 2.158274153016193 | 0.399 | -0.669 | 0 |
| 2.161415745669782 | 0.395 | -0.677 | 0 |
| 2.164557338323372 | 0.391 | -0.686 | 0 |
| 2.167698930976961 | 0.387 | -0.695 | 0 |
| 2.170840523630551 | 0.383 | -0.703 | 0.001 |
| 2.173982116284141 | 0.379 | -0.712 | 0.001 |
| 2.17712370893773 | 0.375 | -0.721 | 0.001 |
| 2.18026530159132 | 0.371 | -0.729 | 0.001 |
| 2.183406894244909 | 0.367 | -0.737 | 0.001 |
| 2.186548486898499 | 0.363 | -0.746 | 0.002 |
| 2.189690079552089 | 0.359 | -0.754 | 0.002 |
| 2.192831672205678 | 0.355 | -0.762 | 0.002 |
| 2.195973264859268 | 0.351 | -0.77 | 0.002 |
| 2.199114857512857 | 0.347 | -0.778 | 0.003 |
| 2.202256450166447 | 0.343 | -0.786 | 0.003 |
| 2.205398042820036 | 0.339 | -0.794 | 0.004 |
| 2.208539635473626 | 0.335 | -0.802 | 0.004 |
| 2.211681228127216 | 0.331 | -0.809 | 0.005 |
| 2.214822820780805 | 0.327 | -0.817 | 0.006 |
| 2.217964413434395 | 0.323 | -0.824 | 0.006 |
| 2.221106006087984 | 0.319 | -0.831 | 0.007 |
| 2.224247598741574 | 0.316 | -0.838 | 0.008 |
| 2.227389191395164 | 0.312 | -0.846 | 0.009 |
| 2.230530784048753 | 0.308 | -0.852 | 0.01 |
| 2.233672376702343 | 0.304 | -0.859 | 0.011 |
| 2.236813969355933 | 0.301 | -0.866 | 0.012 |
| 2.239955562009522 | 0.297 | -0.873 | 0.014 |
| 2.243097154663112 | 0.293 | -0.879 | 0.015 |
| 2.246238747316701 | 0.29 | -0.885 | 0.016 |
| 2.249380339970291 | 0.286 | -0.891 | 0.018 |
| 2.252521932623881 | 0.282 | -0.897 | 0.02 |
| 2.25566352527747 | 0.279 | -0.903 | 0.022 |
| 2.25880511793106 | 0.275 | -0.909 | 0.024 |
| 2.261946710584649 | 0.272 | -0.915 | 0.026 |
| 2.265088303238239 | 0.268 | -0.92 | 0.028 |
| 2.268229895891829 | 0.265 | -0.925 | 0.031 |
| 2.271371488545418 | 0.261 | -0.93 | 0.033 |
| 2.274513081199008 | 0.258 | -0.935 | 0.036 |
| 2.277654673852597 | 0.254 | -0.94 | 0.039 |
| 2.280796266506186 | 0.251 | -0.945 | 0.042 |
| 2.283937859159776 | 0.247 | -0.949 | 0.045 |
| 2.287079451813366 | 0.244 | -0.953 | 0.049 |
| 2.290221044466955 | 0.241 | -0.957 | 0.052 |
| 2.293362637120545 | 0.237 | -0.961 | 0.056 |
| 2.296504229774135 | 0.234 | -0.965 | 0.06 |
| 2.299645822427724 | 0.231 | -0.968 | 0.064 |
| 2.302787415081314 | 0.228 | -0.972 | 0.069 |
| 2.305929007734904 | 0.225 | -0.975 | 0.073 |
| 2.309070600388493 | 0.221 | -0.978 | 0.078 |
| 2.312212193042083 | 0.218 | -0.981 | 0.083 |
| 2.315353785695672 | 0.215 | -0.983 | 0.088 |
| 2.318495378349262 | 0.212 | -0.986 | 0.094 |
| 2.321636971002852 | 0.209 | -0.988 | 0.099 |
| 2.324778563656441 | 0.206 | -0.99 | 0.105 |
| 2.327920156310031 | 0.203 | -0.992 | 0.111 |
| 2.33106174896362 | 0.2 | -0.994 | 0.118 |
| 2.33420334161721 | 0.197 | -0.995 | 0.124 |
| 2.3373449342708 | 0.194 | -0.996 | 0.131 |
| 2.340486526924389 | 0.191 | -0.998 | 0.138 |
| 2.343628119577979 | 0.188 | -0.998 | 0.145 |
| 2.346769712231568 | 0.185 | -0.999 | 0.153 |
| 2.349911304885158 | 0.182 | -1 | 0.161 |
| 2.353052897538748 | 0.18 | -1 | 0.169 |
| 2.356194490192337 | 0.177 | -1 | 0.177 |
| 2.359336082845927 | 0.174 | -1 | 0.185 |
| 2.362477675499516 | 0.171 | -1 | 0.194 |
| 2.365619268153106 | 0.169 | -0.999 | 0.203 |
| 2.368760860806696 | 0.166 | -0.998 | 0.212 |
| 2.371902453460285 | 0.163 | -0.998 | 0.221 |
| 2.375044046113875 | 0.161 | -0.996 | 0.231 |
| 2.378185638767464 | 0.158 | -0.995 | 0.241 |
| 2.381327231421054 | 0.155 | -0.994 | 0.251 |
| 2.384468824074644 | 0.153 | -0.992 | 0.261 |
| 2.387610416728233 | 0.15 | -0.99 | 0.272 |
| 2.390752009381823 | 0.148 | -0.988 | 0.282 |
| 2.393893602035412 | 0.145 | -0.986 | 0.293 |
| 2.397035194689002 | 0.143 | -0.983 | 0.304 |
| 2.400176787342591 | 0.14 | -0.981 | 0.316 |
| 2.403318379996181 | 0.138 | -0.978 | 0.327 |
| 2.406459972649771 | 0.136 | -0.975 | 0.339 |
| 2.40960156530336 | 0.133 | -0.972 | 0.351 |
| 2.41274315795695 | 0.131 | -0.968 | 0.363 |
| 2.41588475061054 | 0.129 | -0.965 | 0.375 |
| 2.419026343264129 | 0.126 | -0.961 | 0.387 |
| 2.422167935917719 | 0.124 | -0.957 | 0.399 |
| 2.425309528571308 | 0.122 | -0.953 | 0.412 |
| 2.428451121224898 | 0.12 | -0.949 | 0.425 |
| 2.431592713878488 | 0.118 | -0.945 | 0.438 |
| 2.434734306532077 | 0.116 | -0.94 | 0.451 |
| 2.437875899185667 | 0.113 | -0.935 | 0.464 |
| 2.441017491839256 | 0.111 | -0.93 | 0.477 |
| 2.444159084492846 | 0.109 | -0.925 | 0.49 |
| 2.447300677146435 | 0.107 | -0.92 | 0.503 |
| 2.450442269800025 | 0.105 | -0.915 | 0.517 |
| 2.453583862453615 | 0.103 | -0.909 | 0.53 |
| 2.456725455107204 | 0.101 | -0.903 | 0.544 |
| 2.459867047760794 | 0.099 | -0.897 | 0.557 |
| 2.463008640414384 | 0.097 | -0.891 | 0.571 |
| 2.466150233067973 | 0.096 | -0.885 | 0.584 |
| 2.469291825721563 | 0.094 | -0.879 | 0.598 |
| 2.472433418375152 | 0.092 | -0.873 | 0.611 |
| 2.475575011028742 | 0.09 | -0.866 | 0.624 |
| 2.478716603682332 | 0.088 | -0.859 | 0.638 |
| 2.481858196335921 | 0.086 | -0.852 | 0.651 |
| 2.48499978898951 | 0.085 | -0.846 | 0.664 |
| 2.4881413816431 | 0.083 | -0.838 | 0.677 |
| 2.49128297429669 | 0.081 | -0.831 | 0.691 |
| 2.49442456695028 | 0.08 | -0.824 | 0.703 |
| 2.497566159603869 | 0.078 | -0.817 | 0.716 |
| 2.500707752257458 | 0.076 | -0.809 | 0.729 |
| 2.503849344911048 | 0.075 | -0.802 | 0.742 |
| 2.506990937564638 | 0.073 | -0.794 | 0.754 |
| 2.510132530218228 | 0.072 | -0.786 | 0.766 |
| 2.513274122871817 | 0.07 | -0.778 | 0.778 |
| 2.516415715525407 | 0.069 | -0.77 | 0.79 |
| 2.519557308178996 | 0.067 | -0.762 | 0.802 |
| 2.522698900832586 | 0.066 | -0.754 | 0.813 |
| 2.525840493486176 | 0.064 | -0.746 | 0.824 |
| 2.528982086139765 | 0.063 | -0.737 | 0.835 |
| 2.532123678793355 | 0.061 | -0.729 | 0.846 |
| 2.535265271446944 | 0.06 | -0.721 | 0.856 |
| 2.538406864100534 | 0.059 | -0.712 | 0.866 |
| 2.541548456754124 | 0.057 | -0.703 | 0.876 |
| 2.544690049407713 | 0.056 | -0.695 | 0.885 |
| 2.547831642061302 | 0.055 | -0.686 | 0.894 |
| 2.550973234714892 | 0.054 | -0.677 | 0.903 |
| 2.554114827368482 | 0.052 | -0.669 | 0.912 |
| 2.557256420022072 | 0.051 | -0.66 | 0.92 |
| 2.560398012675661 | 0.05 | -0.651 | 0.928 |
| 2.563539605329251 | 0.049 | -0.642 | 0.935 |
| 2.56668119798284 | 0.048 | -0.633 | 0.942 |
| 2.56982279063643 | 0.046 | -0.624 | 0.949 |
| 2.57296438329002 | 0.045 | -0.615 | 0.955 |
| 2.576105975943609 | 0.044 | -0.606 | 0.961 |
| 2.579247568597199 | 0.043 | -0.598 | 0.967 |
| 2.582389161250788 | 0.042 | -0.589 | 0.972 |
| 2.585530753904377 | 0.041 | -0.58 | 0.977 |
| 2.588672346557967 | 0.04 | -0.571 | 0.981 |
| 2.591813939211557 | 0.039 | -0.562 | 0.985 |
| 2.594955531865147 | 0.038 | -0.553 | 0.988 |
| 2.598097124518736 | 0.037 | -0.544 | 0.991 |
| 2.601238717172326 | 0.036 | -0.535 | 0.994 |
| 2.604380309825915 | 0.035 | -0.526 | 0.996 |
| 2.607521902479505 | 0.034 | -0.517 | 0.998 |
| 2.610663495133095 | 0.033 | -0.508 | 0.999 |
| 2.613805087786684 | 0.032 | -0.499 | 1 |
| 2.616946680440274 | 0.032 | -0.49 | 1 |
| 2.620088273093863 | 0.031 | -0.481 | 1 |
| 2.623229865747452 | 0.03 | -0.472 | 0.999 |
| 2.626371458401042 | 0.029 | -0.464 | 0.998 |
| 2.629513051054632 | 0.028 | -0.455 | 0.997 |
| 2.632654643708222 | 0.027 | -0.446 | 0.995 |
| 2.635796236361811 | 0.027 | -0.438 | 0.993 |
| 2.638937829015401 | 0.026 | -0.429 | 0.99 |
| 2.642079421668991 | 0.025 | -0.421 | 0.987 |
| 2.64522101432258 | 0.024 | -0.412 | 0.983 |
| 2.64836260697617 | 0.024 | -0.404 | 0.979 |
| 2.651504199629759 | 0.023 | -0.395 | 0.975 |
| 2.654645792283349 | 0.022 | -0.387 | 0.97 |
| 2.657787384936938 | 0.022 | -0.379 | 0.965 |
| 2.660928977590528 | 0.021 | -0.371 | 0.959 |
| 2.664070570244118 | 0.021 | -0.363 | 0.953 |
| 2.667212162897707 | 0.02 | -0.355 | 0.947 |
| 2.670353755551297 | 0.019 | -0.347 | 0.94 |
| 2.673495348204887 | 0.019 | -0.339 | 0.933 |
| 2.676636940858476 | 0.018 | -0.331 | 0.925 |
| 2.679778533512066 | 0.018 | -0.323 | 0.917 |
| 2.682920126165655 | 0.017 | -0.316 | 0.909 |
| 2.686061718819245 | 0.016 | -0.308 | 0.9 |
| 2.689203311472835 | 0.016 | -0.301 | 0.891 |
| 2.692344904126424 | 0.015 | -0.293 | 0.882 |
| 2.695486496780014 | 0.015 | -0.286 | 0.873 |
| 2.698628089433603 | 0.014 | -0.279 | 0.863 |
| 2.701769682087193 | 0.014 | -0.272 | 0.852 |
| 2.704911274740782 | 0.014 | -0.265 | 0.842 |
| 2.708052867394372 | 0.013 | -0.258 | 0.831 |
| 2.711194460047962 | 0.013 | -0.251 | 0.82 |
| 2.714336052701551 | 0.012 | -0.244 | 0.809 |
| 2.717477645355141 | 0.012 | -0.237 | 0.798 |
| 2.720619238008731 | 0.011 | -0.231 | 0.786 |
| 2.72376083066232 | 0.011 | -0.225 | 0.774 |
| 2.72690242331591 | 0.011 | -0.218 | 0.762 |
| 2.730044015969499 | 0.01 | -0.212 | 0.75 |
| 2.733185608623089 | 0.01 | -0.206 | 0.737 |
| 2.736327201276678 | 0.01 | -0.2 | 0.725 |
| 2.739468793930268 | 0.009 | -0.194 | 0.712 |
| 2.742610386583858 | 0.009 | -0.188 | 0.699 |
| 2.745751979237447 | 0.009 | -0.182 | 0.686 |
| 2.748893571891036 | 0.008 | -0.177 | 0.673 |
| 2.752035164544627 | 0.008 | -0.171 | 0.66 |
| 2.755176757198216 | 0.008 | -0.166 | 0.647 |
| 2.758318349851806 | 0.007 | -0.161 | 0.633 |
| 2.761459942505395 | 0.007 | -0.155 | 0.62 |
| 2.764601535158985 | 0.007 | -0.15 | 0.606 |
| 2.767743127812574 | 0.006 | -0.145 | 0.593 |
| 2.770884720466164 | 0.006 | -0.14 | 0.58 |
| 2.774026313119754 | 0.006 | -0.136 | 0.566 |
| 2.777167905773343 | 0.006 | -0.131 | 0.553 |
| 2.780309498426932 | 0.006 | -0.126 | 0.539 |
| 2.783451091080522 | 0.005 | -0.122 | 0.526 |
| 2.786592683734112 | 0.005 | -0.118 | 0.512 |
| 2.789734276387701 | 0.005 | -0.113 | 0.499 |
| 2.792875869041291 | 0.005 | -0.109 | 0.486 |
| 2.796017461694881 | 0.004 | -0.105 | 0.472 |
| 2.79915905434847 | 0.004 | -0.101 | 0.459 |
| 2.80230064700206 | 0.004 | -0.097 | 0.446 |
| 2.80544223965565 | 0.004 | -0.094 | 0.433 |
| 2.808583832309239 | 0.004 | -0.09 | 0.421 |
| 2.811725424962829 | 0.004 | -0.086 | 0.408 |
| 2.814867017616419 | 0.003 | -0.083 | 0.395 |
| 2.818008610270008 | 0.003 | -0.08 | 0.383 |
| 2.821150202923598 | 0.003 | -0.076 | 0.371 |
| 2.824291795577187 | 0.003 | -0.073 | 0.359 |
| 2.827433388230777 | 0.003 | -0.07 | 0.347 |
| 2.830574980884366 | 0.003 | -0.067 | 0.335 |
| 2.833716573537956 | 0.003 | -0.064 | 0.323 |
| 2.836858166191546 | 0.002 | -0.061 | 0.312 |
| 2.839999758845135 | 0.002 | -0.059 | 0.301 |
| 2.843141351498725 | 0.002 | -0.056 | 0.29 |
| 2.846282944152314 | 0.002 | -0.054 | 0.279 |
| 2.849424536805904 | 0.002 | -0.051 | 0.268 |
| 2.852566129459494 | 0.002 | -0.049 | 0.258 |
| 2.855707722113083 | 0.002 | -0.046 | 0.247 |
| 2.858849314766673 | 0.002 | -0.044 | 0.237 |
| 2.861990907420262 | 0.002 | -0.042 | 0.228 |
| 2.865132500073852 | 0.002 | -0.04 | 0.218 |
| 2.868274092727442 | 0.001 | -0.038 | 0.209 |
| 2.871415685381031 | 0.001 | -0.036 | 0.2 |
| 2.874557278034621 | 0.001 | -0.034 | 0.191 |
| 2.87769887068821 | 0.001 | -0.032 | 0.182 |
| 2.8808404633418 | 0.001 | -0.031 | 0.174 |
| 2.88398205599539 | 0.001 | -0.029 | 0.166 |
| 2.88712364864898 | 0.001 | -0.027 | 0.158 |
| 2.890265241302569 | 0.001 | -0.026 | 0.15 |
| 2.893406833956158 | 0.001 | -0.024 | 0.143 |
| 2.896548426609748 | 0.001 | -0.023 | 0.136 |
| 2.899690019263338 | 0.001 | -0.022 | 0.129 |
| 2.902831611916927 | 0.001 | -0.021 | 0.122 |
| 2.905973204570517 | 0.001 | -0.019 | 0.116 |
| 2.909114797224106 | 0.001 | -0.018 | 0.109 |
| 2.912256389877696 | 0.001 | -0.017 | 0.103 |
| 2.915397982531286 | 0.001 | -0.016 | 0.097 |
| 2.918539575184875 | 0.001 | -0.015 | 0.092 |
| 2.921681167838465 | 0 | -0.014 | 0.086 |
| 2.924822760492054 | 0 | -0.013 | 0.081 |
| 2.927964353145644 | 0 | -0.012 | 0.076 |
| 2.931105945799234 | 0 | -0.011 | 0.072 |
| 2.934247538452823 | 0 | -0.011 | 0.067 |
| 2.937389131106413 | 0 | -0.01 | 0.063 |
| 2.940530723760002 | 0 | -0.009 | 0.059 |
| 2.943672316413592 | 0 | -0.009 | 0.055 |
| 2.946813909067182 | 0 | -0.008 | 0.051 |
| 2.949955501720771 | 0 | -0.007 | 0.048 |
| 2.953097094374361 | 0 | -0.007 | 0.044 |
| 2.95623868702795 | 0 | -0.006 | 0.041 |
| 2.95938027968154 | 0 | -0.006 | 0.038 |
| 2.96252187233513 | 0 | -0.005 | 0.035 |
| 2.965663464988719 | 0 | -0.005 | 0.032 |
| 2.968805057642309 | 0 | -0.004 | 0.03 |
| 2.971946650295898 | 0 | -0.004 | 0.027 |
| 2.975088242949488 | 0 | -0.004 | 0.025 |
| 2.978229835603078 | 0 | -0.003 | 0.023 |
| 2.981371428256667 | 0 | -0.003 | 0.021 |
| 2.984513020910257 | 0 | -0.003 | 0.019 |
| 2.987654613563846 | 0 | -0.003 | 0.018 |
| 2.990796206217436 | 0 | -0.002 | 0.016 |
| 2.993937798871025 | 0 | -0.002 | 0.014 |
| 2.997079391524615 | 0 | -0.002 | 0.013 |
| 3.000220984178205 | 0 | -0.002 | 0.012 |
| 3.003362576831794 | 0 | -0.002 | 0.011 |
| 3.006504169485384 | 0 | -0.001 | 0.01 |
| 3.009645762138974 | 0 | -0.001 | 0.009 |
| 3.012787354792563 | 0 | -0.001 | 0.008 |
| 3.015928947446153 | 0 | -0.001 | 0.007 |
| 3.019070540099742 | 0 | -0.001 | 0.006 |
| 3.022212132753332 | 0 | -0.001 | 0.005 |
| 3.025353725406922 | 0 | -0.001 | 0.005 |
| 3.028495318060511 | 0 | -0.001 | 0.004 |
| 3.031636910714101 | 0 | 0 | 0.004 |
| 3.03477850336769 | 0 | 0 | 0.003 |
| 3.03792009602128 | 0 | 0 | 0.003 |
| 3.04106168867487 | 0 | 0 | 0.002 |
| 3.04420328132846 | 0 | 0 | 0.002 |
| 3.047344873982049 | 0 | 0 | 0.002 |
| 3.050486466635638 | 0 | 0 | 0.001 |
| 3.053628059289228 | 0 | 0 | 0.001 |
| 3.056769651942818 | 0 | 0 | 0.001 |
| 3.059911244596407 | 0 | 0 | 0.001 |
| 3.063052837249997 | 0 | 0 | 0.001 |
| 3.066194429903586 | 0 | 0 | 0.001 |
| 3.069336022557176 | 0 | 0 | 0 |
| 3.072477615210766 | 0 | 0 | 0 |
| 3.075619207864355 | 0 | 0 | 0 |
| 3.078760800517945 | 0 | 0 | 0 |
| 3.081902393171534 | 0 | 0 | 0 |
| 3.085043985825124 | 0 | 0 | 0 |
| 3.088185578478713 | 0 | 0 | 0 |
| 3.091327171132303 | 0 | 0 | 0 |
| 3.094468763785893 | 0 | 0 | 0 |
| 3.097610356439482 | 0 | 0 | 0 |
| 3.100751949093072 | 0 | 0 | 0 |
| 3.103893541746661 | 0 | 0 | 0 |
| 3.107035134400251 | 0 | 0 | 0 |
| 3.110176727053841 | 0 | 0 | 0 |
| 3.11331831970743 | 0 | 0 | 0 |
| 3.11645991236102 | 0 | 0 | 0 |
| 3.11960150501461 | 0 | 0 | 0 |
| 3.122743097668199 | 0 | 0 | 0 |
| 3.125884690321789 | 0 | 0 | 0 |
| 3.129026282975378 | 0 | 0 | 0 |
| 3.132167875628968 | 0 | 0 | 0 |
| 3.135309468282557 | 0 | 0 | 0 |
| 3.138451060936147 | 0 | 0 | 0 |
| 3.141592653589737 | 0 | 0 | 0 |
| 3.144734246243326 | 0 | 0 | 0 |
| 3.147875838896916 | 0 | 0 | 0 |
| 3.151017431550505 | 0 | 0 | 0 |
| 3.154159024204095 | 0 | 0 | 0 |
| 3.157300616857685 | 0 | 0 | 0 |
| 3.160442209511274 | 0 | 0 | 0 |
| 3.163583802164864 | 0 | 0 | 0 |
| 3.166725394818453 | 0 | 0 | 0 |
| 3.169866987472043 | 0 | 0 | 0 |
| 3.173008580125633 | 0 | 0 | 0 |
| 3.176150172779222 | 0 | 0 | 0 |
| 3.179291765432812 | 0 | 0 | 0 |
| 3.182433358086401 | 0 | 0 | 0 |
| 3.185574950739991 | 0 | 0 | 0 |
| 3.188716543393581 | 0 | 0 | 0 |
| 3.19185813604717 | 0 | 0 | 0 |
| 3.19499972870076 | 0 | 0 | 0 |
| 3.198141321354349 | 0 | 0 | 0 |
| 3.20128291400794 | 0 | 0 | 0 |
| 3.204424506661528 | 0 | 0 | 0 |
| 3.207566099315118 | 0 | 0 | 0 |
| 3.210707691968708 | 0 | 0 | 0 |
| 3.213849284622297 | 0 | 0 | 0 |
| 3.216990877275887 | 0 | 0 | -0.001 |
| 3.220132469929476 | 0 | 0 | -0.001 |
| 3.223274062583066 | 0 | 0 | -0.001 |
| 3.226415655236656 | 0 | 0 | -0.001 |
| 3.229557247890245 | 0 | 0 | -0.001 |
| 3.232698840543835 | 0 | 0 | -0.001 |
| 3.235840433197425 | 0 | 0 | -0.002 |
| 3.238982025851014 | 0 | 0 | -0.002 |
| 3.242123618504604 | 0 | 0 | -0.002 |
| 3.245265211158193 | 0 | 0 | -0.003 |
| 3.248406803811783 | 0 | 0 | -0.003 |
| 3.251548396465373 | 0 | 0 | -0.004 |
| 3.254689989118962 | 0 | 0.001 | -0.004 |
| 3.257831581772551 | 0 | 0.001 | -0.005 |
| 3.260973174426141 | 0 | 0.001 | -0.005 |
| 3.26411476707973 | 0 | 0.001 | -0.006 |
| 3.267256359733321 | 0 | 0.001 | -0.007 |
| 3.27039795238691 | 0 | 0.001 | -0.008 |
| 3.2735395450405 | 0 | 0.001 | -0.009 |
| 3.276681137694089 | 0 | 0.001 | -0.01 |
| 3.279822730347679 | 0 | 0.002 | -0.011 |
| 3.282964323001269 | 0 | 0.002 | -0.012 |
| 3.286105915654858 | 0 | 0.002 | -0.013 |
| 3.289247508308448 | 0 | 0.002 | -0.014 |
| 3.292389100962037 | 0 | 0.002 | -0.016 |
| 3.295530693615627 | 0 | 0.003 | -0.018 |
| 3.298672286269217 | 0 | 0.003 | -0.019 |
| 3.301813878922806 | 0 | 0.003 | -0.021 |
| 3.304955471576396 | 0 | 0.003 | -0.023 |
| 3.308097064229985 | 0 | 0.004 | -0.025 |
| 3.311238656883575 | 0 | 0.004 | -0.027 |
| 3.314380249537165 | 0 | 0.004 | -0.03 |
| 3.317521842190754 | 0 | 0.005 | -0.032 |
| 3.320663434844344 | 0 | 0.005 | -0.035 |
| 3.323805027497933 | 0 | 0.006 | -0.038 |
| 3.326946620151523 | 0 | 0.006 | -0.041 |
| 3.330088212805113 | 0 | 0.007 | -0.044 |
| 3.333229805458702 | 0 | 0.007 | -0.048 |
| 3.336371398112292 | 0 | 0.008 | -0.051 |
| 3.339512990765881 | 0 | 0.009 | -0.055 |
| 3.342654583419471 | 0 | 0.009 | -0.059 |
| 3.345796176073061 | 0 | 0.01 | -0.063 |
| 3.34893776872665 | 0 | 0.011 | -0.067 |
| 3.35207936138024 | 0 | 0.011 | -0.072 |
| 3.355220954033829 | 0 | 0.012 | -0.076 |
| 3.358362546687419 | 0 | 0.013 | -0.081 |
| 3.361504139341009 | 0 | 0.014 | -0.086 |
| 3.364645731994598 | -0.001 | 0.015 | -0.092 |
| 3.367787324648188 | -0.001 | 0.016 | -0.097 |
| 3.370928917301777 | -0.001 | 0.017 | -0.103 |
| 3.374070509955367 | -0.001 | 0.018 | -0.109 |
| 3.377212102608956 | -0.001 | 0.019 | -0.116 |
| 3.380353695262546 | -0.001 | 0.021 | -0.122 |
| 3.383495287916136 | -0.001 | 0.022 | -0.129 |
| 3.386636880569725 | -0.001 | 0.023 | -0.136 |
| 3.389778473223315 | -0.001 | 0.024 | -0.143 |
| 3.392920065876904 | -0.001 | 0.026 | -0.15 |
| 3.396061658530494 | -0.001 | 0.027 | -0.158 |
| 3.399203251184084 | -0.001 | 0.029 | -0.166 |
| 3.402344843837673 | -0.001 | 0.031 | -0.174 |
| 3.405486436491263 | -0.001 | 0.032 | -0.182 |
| 3.408628029144852 | -0.001 | 0.034 | -0.191 |
| 3.411769621798442 | -0.001 | 0.036 | -0.2 |
| 3.414911214452032 | -0.001 | 0.038 | -0.209 |
| 3.418052807105621 | -0.002 | 0.04 | -0.218 |
| 3.421194399759211 | -0.002 | 0.042 | -0.228 |
| 3.4243359924128 | -0.002 | 0.044 | -0.237 |
| 3.42747758506639 | -0.002 | 0.046 | -0.247 |
| 3.43061917771998 | -0.002 | 0.049 | -0.258 |
| 3.433760770373569 | -0.002 | 0.051 | -0.268 |
| 3.436902363027159 | -0.002 | 0.054 | -0.279 |
| 3.440043955680748 | -0.002 | 0.056 | -0.29 |
| 3.443185548334338 | -0.002 | 0.059 | -0.301 |
| 3.446327140987927 | -0.002 | 0.061 | -0.312 |
| 3.449468733641517 | -0.003 | 0.064 | -0.323 |
| 3.452610326295107 | -0.003 | 0.067 | -0.335 |
| 3.455751918948696 | -0.003 | 0.07 | -0.347 |
| 3.458893511602286 | -0.003 | 0.073 | -0.359 |
| 3.462035104255876 | -0.003 | 0.076 | -0.371 |
| 3.465176696909465 | -0.003 | 0.08 | -0.383 |
| 3.468318289563055 | -0.003 | 0.083 | -0.395 |
| 3.471459882216644 | -0.004 | 0.086 | -0.408 |
| 3.474601474870234 | -0.004 | 0.09 | -0.421 |
| 3.477743067523824 | -0.004 | 0.094 | -0.433 |
| 3.480884660177413 | -0.004 | 0.097 | -0.446 |
| 3.484026252831002 | -0.004 | 0.101 | -0.459 |
| 3.487167845484592 | -0.004 | 0.105 | -0.472 |
| 3.490309438138182 | -0.005 | 0.109 | -0.486 |
| 3.493451030791772 | -0.005 | 0.113 | -0.499 |
| 3.496592623445361 | -0.005 | 0.118 | -0.512 |
| 3.499734216098951 | -0.005 | 0.122 | -0.526 |
| 3.50287580875254 | -0.006 | 0.126 | -0.539 |
| 3.50601740140613 | -0.006 | 0.131 | -0.553 |
| 3.50915899405972 | -0.006 | 0.136 | -0.566 |
| 3.512300586713309 | -0.006 | 0.14 | -0.58 |
| 3.515442179366899 | -0.006 | 0.145 | -0.593 |
| 3.518583772020488 | -0.007 | 0.15 | -0.606 |
| 3.521725364674078 | -0.007 | 0.155 | -0.62 |
| 3.524866957327668 | -0.007 | 0.161 | -0.633 |
| 3.528008549981257 | -0.008 | 0.166 | -0.647 |
| 3.531150142634847 | -0.008 | 0.171 | -0.66 |
| 3.534291735288436 | -0.008 | 0.177 | -0.673 |
| 3.537433327942026 | -0.009 | 0.182 | -0.686 |
| 3.540574920595616 | -0.009 | 0.188 | -0.699 |
| 3.543716513249205 | -0.009 | 0.194 | -0.712 |
| 3.546858105902795 | -0.01 | 0.2 | -0.725 |
| 3.549999698556384 | -0.01 | 0.206 | -0.737 |
| 3.553141291209974 | -0.01 | 0.212 | -0.75 |
| 3.556282883863564 | -0.011 | 0.218 | -0.762 |
| 3.559424476517153 | -0.011 | 0.225 | -0.774 |
| 3.562566069170743 | -0.011 | 0.231 | -0.786 |
| 3.565707661824332 | -0.012 | 0.237 | -0.798 |
| 3.568849254477922 | -0.012 | 0.244 | -0.809 |
| 3.571990847131511 | -0.013 | 0.251 | -0.82 |
| 3.575132439785101 | -0.013 | 0.258 | -0.831 |
| 3.578274032438691 | -0.014 | 0.265 | -0.842 |
| 3.58141562509228 | -0.014 | 0.272 | -0.852 |
| 3.58455721774587 | -0.014 | 0.279 | -0.863 |
| 3.58769881039946 | -0.015 | 0.286 | -0.873 |
| 3.590840403053049 | -0.015 | 0.293 | -0.882 |
| 3.593981995706639 | -0.016 | 0.301 | -0.891 |
| 3.597123588360228 | -0.016 | 0.308 | -0.9 |
| 3.600265181013818 | -0.017 | 0.316 | -0.909 |
| 3.603406773667407 | -0.018 | 0.323 | -0.917 |
| 3.606548366320997 | -0.018 | 0.331 | -0.925 |
| 3.609689958974587 | -0.019 | 0.339 | -0.933 |
| 3.612831551628176 | -0.019 | 0.347 | -0.94 |
| 3.615973144281766 | -0.02 | 0.355 | -0.947 |
| 3.619114736935355 | -0.021 | 0.363 | -0.953 |
| 3.622256329588945 | -0.021 | 0.371 | -0.959 |
| 3.625397922242534 | -0.022 | 0.379 | -0.965 |
| 3.628539514896124 | -0.022 | 0.387 | -0.97 |
| 3.631681107549714 | -0.023 | 0.395 | -0.975 |
| 3.634822700203303 | -0.024 | 0.404 | -0.979 |
| 3.637964292856893 | -0.024 | 0.412 | -0.983 |
| 3.641105885510483 | -0.025 | 0.421 | -0.987 |
| 3.644247478164072 | -0.026 | 0.429 | -0.99 |
| 3.647389070817662 | -0.027 | 0.438 | -0.993 |
| 3.650530663471251 | -0.027 | 0.446 | -0.995 |
| 3.653672256124841 | -0.028 | 0.455 | -0.997 |
| 3.656813848778431 | -0.029 | 0.464 | -0.998 |
| 3.65995544143202 | -0.03 | 0.472 | -0.999 |
| 3.66309703408561 | -0.031 | 0.481 | -1 |
| 3.666238626739199 | -0.032 | 0.49 | -1 |
| 3.66938021939279 | -0.032 | 0.499 | -1 |
| 3.672521812046378 | -0.033 | 0.508 | -0.999 |
| 3.675663404699968 | -0.034 | 0.517 | -0.998 |
| 3.678804997353558 | -0.035 | 0.526 | -0.996 |
| 3.681946590007147 | -0.036 | 0.535 | -0.994 |
| 3.685088182660737 | -0.037 | 0.544 | -0.991 |
| 3.688229775314326 | -0.038 | 0.553 | -0.988 |
| 3.691371367967916 | -0.039 | 0.562 | -0.985 |
| 3.694512960621506 | -0.04 | 0.571 | -0.981 |
| 3.697654553275095 | -0.041 | 0.58 | -0.977 |
| 3.700796145928685 | -0.042 | 0.589 | -0.972 |
| 3.703937738582274 | -0.043 | 0.598 | -0.967 |
| 3.707079331235864 | -0.044 | 0.606 | -0.961 |
| 3.710220923889454 | -0.045 | 0.615 | -0.955 |
| 3.713362516543043 | -0.046 | 0.624 | -0.949 |
| 3.716504109196633 | -0.048 | 0.633 | -0.942 |
| 3.719645701850223 | -0.049 | 0.642 | -0.935 |
| 3.722787294503812 | -0.05 | 0.651 | -0.928 |
| 3.725928887157402 | -0.051 | 0.66 | -0.92 |
| 3.729070479810991 | -0.052 | 0.669 | -0.912 |
| 3.732212072464581 | -0.054 | 0.677 | -0.903 |
| 3.735353665118171 | -0.055 | 0.686 | -0.894 |
| 3.73849525777176 | -0.056 | 0.695 | -0.885 |
| 3.74163685042535 | -0.057 | 0.703 | -0.876 |
| 3.744778443078939 | -0.059 | 0.712 | -0.866 |
| 3.747920035732529 | -0.06 | 0.721 | -0.856 |
| 3.751061628386119 | -0.061 | 0.729 | -0.846 |
| 3.754203221039708 | -0.063 | 0.737 | -0.835 |
| 3.757344813693298 | -0.064 | 0.746 | -0.824 |
| 3.760486406346887 | -0.066 | 0.754 | -0.813 |
| 3.763627999000477 | -0.067 | 0.762 | -0.802 |
| 3.766769591654067 | -0.069 | 0.77 | -0.79 |
| 3.769911184307656 | -0.07 | 0.778 | -0.778 |
| 3.773052776961246 | -0.072 | 0.786 | -0.766 |
| 3.776194369614835 | -0.073 | 0.794 | -0.754 |
| 3.779335962268425 | -0.075 | 0.802 | -0.742 |
| 3.782477554922014 | -0.076 | 0.809 | -0.729 |
| 3.785619147575604 | -0.078 | 0.817 | -0.716 |
| 3.788760740229193 | -0.08 | 0.824 | -0.703 |
| 3.791902332882783 | -0.081 | 0.831 | -0.691 |
| 3.795043925536373 | -0.083 | 0.838 | -0.677 |
| 3.798185518189962 | -0.085 | 0.846 | -0.664 |
| 3.801327110843552 | -0.086 | 0.852 | -0.651 |
| 3.804468703497142 | -0.088 | 0.859 | -0.638 |
| 3.807610296150731 | -0.09 | 0.866 | -0.624 |
| 3.810751888804321 | -0.092 | 0.873 | -0.611 |
| 3.813893481457911 | -0.094 | 0.879 | -0.598 |
| 3.8170350741115 | -0.096 | 0.885 | -0.584 |
| 3.82017666676509 | -0.097 | 0.891 | -0.571 |
| 3.823318259418679 | -0.099 | 0.897 | -0.557 |
| 3.826459852072269 | -0.101 | 0.903 | -0.544 |
| 3.829601444725859 | -0.103 | 0.909 | -0.53 |
| 3.832743037379448 | -0.105 | 0.915 | -0.517 |
| 3.835884630033038 | -0.107 | 0.92 | -0.503 |
| 3.839026222686627 | -0.109 | 0.925 | -0.49 |
| 3.842167815340217 | -0.111 | 0.93 | -0.477 |
| 3.845309407993807 | -0.113 | 0.935 | -0.464 |
| 3.848451000647396 | -0.116 | 0.94 | -0.451 |
| 3.851592593300986 | -0.118 | 0.945 | -0.438 |
| 3.854734185954575 | -0.12 | 0.949 | -0.425 |
| 3.857875778608165 | -0.122 | 0.953 | -0.412 |
| 3.861017371261755 | -0.124 | 0.957 | -0.399 |
| 3.864158963915344 | -0.126 | 0.961 | -0.387 |
| 3.867300556568933 | -0.129 | 0.965 | -0.375 |
| 3.870442149222523 | -0.131 | 0.968 | -0.363 |
| 3.873583741876112 | -0.133 | 0.972 | -0.351 |
| 3.876725334529703 | -0.136 | 0.975 | -0.339 |
| 3.879866927183292 | -0.138 | 0.978 | -0.327 |
| 3.883008519836882 | -0.14 | 0.981 | -0.316 |
| 3.886150112490471 | -0.143 | 0.983 | -0.304 |
| 3.889291705144061 | -0.145 | 0.986 | -0.293 |
| 3.892433297797651 | -0.148 | 0.988 | -0.282 |
| 3.89557489045124 | -0.15 | 0.99 | -0.272 |
| 3.89871648310483 | -0.153 | 0.992 | -0.261 |
| 3.901858075758419 | -0.155 | 0.994 | -0.251 |
| 3.904999668412009 | -0.158 | 0.995 | -0.241 |
| 3.908141261065598 | -0.161 | 0.996 | -0.231 |
| 3.911282853719188 | -0.163 | 0.998 | -0.221 |
| 3.914424446372778 | -0.166 | 0.998 | -0.212 |
| 3.917566039026367 | -0.169 | 0.999 | -0.203 |
| 3.920707631679957 | -0.171 | 1 | -0.194 |
| 3.923849224333547 | -0.174 | 1 | -0.185 |
| 3.926990816987136 | -0.177 | 1 | -0.177 |
| 3.930132409640726 | -0.18 | 1 | -0.169 |
| 3.933274002294315 | -0.182 | 1 | -0.161 |
| 3.936415594947905 | -0.185 | 0.999 | -0.153 |
| 3.939557187601495 | -0.188 | 0.998 | -0.145 |
| 3.942698780255084 | -0.191 | 0.998 | -0.138 |
| 3.945840372908674 | -0.194 | 0.996 | -0.131 |
| 3.948981965562263 | -0.197 | 0.995 | -0.124 |
| 3.952123558215853 | -0.2 | 0.994 | -0.118 |
| 3.955265150869442 | -0.203 | 0.992 | -0.111 |
| 3.958406743523032 | -0.206 | 0.99 | -0.105 |
| 3.961548336176622 | -0.209 | 0.988 | -0.099 |
| 3.964689928830211 | -0.212 | 0.986 | -0.094 |
| 3.967831521483801 | -0.215 | 0.983 | -0.088 |
| 3.97097311413739 | -0.218 | 0.981 | -0.083 |
| 3.97411470679098 | -0.221 | 0.978 | -0.078 |
| 3.97725629944457 | -0.225 | 0.975 | -0.073 |
| 3.98039789209816 | -0.228 | 0.972 | -0.069 |
| 3.983539484751749 | -0.231 | 0.968 | -0.064 |
| 3.986681077405338 | -0.234 | 0.965 | -0.06 |
| 3.989822670058928 | -0.237 | 0.961 | -0.056 |
| 3.992964262712517 | -0.241 | 0.957 | -0.052 |
| 3.996105855366107 | -0.244 | 0.953 | -0.049 |
| 3.999247448019697 | -0.247 | 0.949 | -0.045 |
| 4.002389040673287 | -0.251 | 0.945 | -0.042 |
| 4.005530633326877 | -0.254 | 0.94 | -0.039 |
| 4.008672225980466 | -0.258 | 0.935 | -0.036 |
| 4.011813818634056 | -0.261 | 0.93 | -0.033 |
| 4.014955411287645 | -0.265 | 0.925 | -0.031 |
| 4.018097003941234 | -0.268 | 0.92 | -0.028 |
| 4.021238596594824 | -0.272 | 0.915 | -0.026 |
| 4.024380189248414 | -0.275 | 0.909 | -0.024 |
| 4.027521781902004 | -0.279 | 0.903 | -0.022 |
| 4.030663374555593 | -0.282 | 0.897 | -0.02 |
| 4.033804967209183 | -0.286 | 0.891 | -0.018 |
| 4.036946559862773 | -0.29 | 0.885 | -0.016 |
| 4.040088152516362 | -0.293 | 0.879 | -0.015 |
| 4.043229745169951 | -0.297 | 0.873 | -0.014 |
| 4.046371337823541 | -0.301 | 0.866 | -0.012 |
| 4.049512930477131 | -0.304 | 0.859 | -0.011 |
| 4.05265452313072 | -0.308 | 0.852 | -0.01 |
| 4.05579611578431 | -0.312 | 0.846 | -0.009 |
| 4.0589377084379 | -0.316 | 0.838 | -0.008 |
| 4.062079301091489 | -0.319 | 0.831 | -0.007 |
| 4.065220893745079 | -0.323 | 0.824 | -0.006 |
| 4.068362486398668 | -0.327 | 0.817 | -0.006 |
| 4.071504079052258 | -0.331 | 0.809 | -0.005 |
| 4.074645671705848 | -0.335 | 0.802 | -0.004 |
| 4.077787264359437 | -0.339 | 0.794 | -0.004 |
| 4.080928857013027 | -0.343 | 0.786 | -0.003 |
| 4.084070449666616 | -0.347 | 0.778 | -0.003 |
| 4.087212042320206 | -0.351 | 0.77 | -0.002 |
| 4.090353634973795 | -0.355 | 0.762 | -0.002 |
| 4.093495227627385 | -0.359 | 0.754 | -0.002 |
| 4.096636820280975 | -0.363 | 0.746 | -0.002 |
| 4.099778412934564 | -0.367 | 0.737 | -0.001 |
| 4.102920005588154 | -0.371 | 0.729 | -0.001 |
| 4.106061598241744 | -0.375 | 0.721 | -0.001 |
| 4.109203190895333 | -0.379 | 0.712 | -0.001 |
| 4.112344783548923 | -0.383 | 0.703 | -0.001 |
| 4.115486376202512 | -0.387 | 0.695 | 0 |
| 4.118627968856102 | -0.391 | 0.686 | 0 |
| 4.121769561509692 | -0.395 | 0.677 | 0 |
| 4.124911154163281 | -0.399 | 0.669 | 0 |
| 4.128052746816871 | -0.404 | 0.66 | 0 |
| 4.13119433947046 | -0.408 | 0.651 | 0 |
| 4.13433593212405 | -0.412 | 0.642 | 0 |
| 4.13747752477764 | -0.416 | 0.633 | 0 |
| 4.14061911743123 | -0.421 | 0.624 | 0 |
| 4.143760710084818 | -0.425 | 0.615 | 0 |
| 4.146902302738408 | -0.429 | 0.606 | 0 |
| 4.150043895391998 | -0.433 | 0.598 | 0 |
| 4.153185488045588 | -0.438 | 0.589 | 0 |
| 4.156327080699177 | -0.442 | 0.58 | 0 |
| 4.159468673352766 | -0.446 | 0.571 | 0 |
| 4.162610266006356 | -0.451 | 0.562 | 0 |
| 4.165751858659946 | -0.455 | 0.553 | 0 |
| 4.168893451313535 | -0.459 | 0.544 | 0 |
| 4.172035043967125 | -0.464 | 0.535 | 0 |
| 4.175176636620715 | -0.468 | 0.526 | 0 |
| 4.178318229274304 | -0.472 | 0.517 | 0 |
| 4.181459821927894 | -0.477 | 0.508 | 0 |
| 4.184601414581484 | -0.481 | 0.499 | 0 |
| 4.187743007235073 | -0.486 | 0.49 | 0 |
| 4.190884599888663 | -0.49 | 0.481 | 0 |
| 4.194026192542252 | -0.495 | 0.472 | 0 |
| 4.197167785195842 | -0.499 | 0.464 | 0 |
| 4.200309377849432 | -0.503 | 0.455 | 0 |
| 4.203450970503021 | -0.508 | 0.446 | 0 |
| 4.206592563156611 | -0.512 | 0.438 | 0 |
| 4.2097341558102 | -0.517 | 0.429 | 0 |
| 4.21287574846379 | -0.521 | 0.421 | 0 |
| 4.21601734111738 | -0.526 | 0.412 | 0 |
| 4.21915893377097 | -0.53 | 0.404 | 0 |
| 4.222300526424559 | -0.535 | 0.395 | 0 |
| 4.225442119078148 | -0.539 | 0.387 | 0 |
| 4.228583711731738 | -0.544 | 0.379 | 0 |
| 4.231725304385327 | -0.548 | 0.371 | 0 |
| 4.234866897038917 | -0.553 | 0.363 | 0 |
| 4.238008489692506 | -0.557 | 0.355 | 0 |
| 4.241150082346096 | -0.562 | 0.347 | 0 |
| 4.244291674999685 | -0.566 | 0.339 | 0 |
| 4.247433267653276 | -0.571 | 0.331 | 0 |
| 4.250574860306865 | -0.575 | 0.323 | 0 |
| 4.253716452960455 | -0.58 | 0.316 | 0 |
| 4.256858045614044 | -0.584 | 0.308 | 0 |
| 4.259999638267634 | -0.589 | 0.301 | 0 |
| 4.263141230921224 | -0.593 | 0.293 | 0.001 |
| 4.266282823574813 | -0.598 | 0.286 | 0.001 |
| 4.269424416228403 | -0.602 | 0.279 | 0.001 |
| 4.272566008881992 | -0.606 | 0.272 | 0.001 |
| 4.275707601535582 | -0.611 | 0.265 | 0.001 |
| 4.27884919418917 | -0.615 | 0.258 | 0.001 |
| 4.28199078684276 | -0.62 | 0.251 | 0.002 |
| 4.285132379496351 | -0.624 | 0.244 | 0.002 |
| 4.28827397214994 | -0.629 | 0.237 | 0.002 |
| 4.29141556480353 | -0.633 | 0.231 | 0.003 |
| 4.294557157457119 | -0.638 | 0.225 | 0.003 |
| 4.29769875011071 | -0.642 | 0.218 | 0.003 |
| 4.300840342764299 | -0.647 | 0.212 | 0.004 |
| 4.303981935417888 | -0.651 | 0.206 | 0.004 |
| 4.307123528071478 | -0.655 | 0.2 | 0.005 |
| 4.310265120725067 | -0.66 | 0.194 | 0.006 |
| 4.313406713378657 | -0.664 | 0.188 | 0.006 |
| 4.316548306032247 | -0.669 | 0.182 | 0.007 |
| 4.319689898685836 | -0.673 | 0.177 | 0.008 |
| 4.322831491339426 | -0.677 | 0.171 | 0.009 |
| 4.325973083993015 | -0.682 | 0.166 | 0.01 |
| 4.329114676646605 | -0.686 | 0.161 | 0.011 |
| 4.332256269300195 | -0.691 | 0.155 | 0.013 |
| 4.335397861953784 | -0.695 | 0.15 | 0.014 |
| 4.338539454607374 | -0.699 | 0.145 | 0.015 |
| 4.341681047260963 | -0.703 | 0.14 | 0.017 |
| 4.344822639914553 | -0.708 | 0.136 | 0.019 |
| 4.347964232568143 | -0.712 | 0.131 | 0.021 |
| 4.351105825221732 | -0.716 | 0.126 | 0.022 |
| 4.354247417875322 | -0.721 | 0.122 | 0.024 |
| 4.357389010528911 | -0.725 | 0.118 | 0.027 |
| 4.360530603182501 | -0.729 | 0.113 | 0.029 |
| 4.36367219583609 | -0.733 | 0.109 | 0.032 |
| 4.36681378848968 | -0.737 | 0.105 | 0.034 |
| 4.36995538114327 | -0.742 | 0.101 | 0.037 |
| 4.373096973796859 | -0.746 | 0.097 | 0.04 |
| 4.376238566450449 | -0.75 | 0.094 | 0.043 |
| 4.379380159104038 | -0.754 | 0.09 | 0.046 |
| 4.382521751757628 | -0.758 | 0.086 | 0.05 |
| 4.385663344411217 | -0.762 | 0.083 | 0.054 |
| 4.388804937064807 | -0.766 | 0.08 | 0.057 |
| 4.391946529718397 | -0.77 | 0.076 | 0.061 |
| 4.395088122371987 | -0.774 | 0.073 | 0.066 |
| 4.398229715025576 | -0.778 | 0.07 | 0.07 |
| 4.401371307679165 | -0.782 | 0.067 | 0.075 |
| 4.404512900332755 | -0.786 | 0.064 | 0.08 |
| 4.407654492986345 | -0.79 | 0.061 | 0.085 |
| 4.410796085639934 | -0.794 | 0.059 | 0.09 |
| 4.413937678293524 | -0.798 | 0.056 | 0.096 |
| 4.417079270947114 | -0.802 | 0.054 | 0.101 |
| 4.420220863600703 | -0.805 | 0.051 | 0.107 |
| 4.423362456254293 | -0.809 | 0.049 | 0.113 |
| 4.426504048907883 | -0.813 | 0.046 | 0.12 |
| 4.429645641561472 | -0.817 | 0.044 | 0.126 |
| 4.432787234215062 | -0.82 | 0.042 | 0.133 |
| 4.435928826868651 | -0.824 | 0.04 | 0.14 |
| 4.43907041952224 | -0.828 | 0.038 | 0.148 |
| 4.44221201217583 | -0.831 | 0.036 | 0.155 |
| 4.44535360482942 | -0.835 | 0.034 | 0.163 |
| 4.44849519748301 | -0.838 | 0.032 | 0.171 |
| 4.4516367901366 | -0.842 | 0.031 | 0.18 |
| 4.454778382790188 | -0.846 | 0.029 | 0.188 |
| 4.457919975443779 | -0.849 | 0.027 | 0.197 |
| 4.461061568097368 | -0.852 | 0.026 | 0.206 |
| 4.464203160750958 | -0.856 | 0.024 | 0.215 |
| 4.467344753404547 | -0.859 | 0.023 | 0.225 |
| 4.470486346058137 | -0.863 | 0.022 | 0.234 |
| 4.473627938711726 | -0.866 | 0.021 | 0.244 |
| 4.476769531365316 | -0.869 | 0.019 | 0.254 |
| 4.479911124018905 | -0.873 | 0.018 | 0.265 |
| 4.483052716672495 | -0.876 | 0.017 | 0.275 |
| 4.486194309326085 | -0.879 | 0.016 | 0.286 |
| 4.489335901979674 | -0.882 | 0.015 | 0.297 |
| 4.492477494633264 | -0.885 | 0.014 | 0.308 |
| 4.495619087286854 | -0.888 | 0.013 | 0.319 |
| 4.498760679940443 | -0.891 | 0.012 | 0.331 |
| 4.501902272594033 | -0.894 | 0.011 | 0.343 |
| 4.505043865247622 | -0.897 | 0.011 | 0.355 |
| 4.508185457901212 | -0.9 | 0.01 | 0.367 |
| 4.511327050554801 | -0.903 | 0.009 | 0.379 |
| 4.514468643208391 | -0.906 | 0.009 | 0.391 |
| 4.517610235861981 | -0.909 | 0.008 | 0.404 |
| 4.520751828515571 | -0.912 | 0.007 | 0.416 |
| 4.52389342116916 | -0.915 | 0.007 | 0.429 |
| 4.52703501382275 | -0.917 | 0.006 | 0.442 |
| 4.530176606476339 | -0.92 | 0.006 | 0.455 |
| 4.533318199129928 | -0.923 | 0.005 | 0.468 |
| 4.536459791783518 | -0.925 | 0.005 | 0.481 |
| 4.539601384437108 | -0.928 | 0.004 | 0.495 |
| 4.542742977090698 | -0.93 | 0.004 | 0.508 |
| 4.545884569744287 | -0.933 | 0.004 | 0.521 |
| 4.549026162397876 | -0.935 | 0.003 | 0.535 |
| 4.552167755051466 | -0.938 | 0.003 | 0.548 |
| 4.555309347705056 | -0.94 | 0.003 | 0.562 |
| 4.558450940358646 | -0.942 | 0.003 | 0.575 |
| 4.561592533012235 | -0.945 | 0.002 | 0.589 |
| 4.564734125665825 | -0.947 | 0.002 | 0.602 |
| 4.567875718319415 | -0.949 | 0.002 | 0.615 |
| 4.571017310973004 | -0.951 | 0.002 | 0.629 |
| 4.574158903626594 | -0.953 | 0.002 | 0.642 |
| 4.577300496280183 | -0.955 | 0.001 | 0.655 |
| 4.580442088933772 | -0.957 | 0.001 | 0.669 |
| 4.583583681587362 | -0.959 | 0.001 | 0.682 |
| 4.586725274240952 | -0.961 | 0.001 | 0.695 |
| 4.589866866894542 | -0.963 | 0.001 | 0.708 |
| 4.593008459548131 | -0.965 | 0.001 | 0.721 |
| 4.596150052201721 | -0.967 | 0.001 | 0.733 |
| 4.59929164485531 | -0.968 | 0.001 | 0.746 |
| 4.6024332375089 | -0.97 | 0 | 0.758 |
| 4.60557483016249 | -0.972 | 0 | 0.77 |
| 4.608716422816079 | -0.973 | 0 | 0.782 |
| 4.611858015469668 | -0.975 | 0 | 0.794 |
| 4.614999608123258 | -0.977 | 0 | 0.805 |
| 4.618141200776848 | -0.978 | 0 | 0.817 |
| 4.621282793430437 | -0.979 | 0 | 0.828 |
| 4.624424386084027 | -0.981 | 0 | 0.838 |
| 4.627565978737617 | -0.982 | 0 | 0.849 |
| 4.630707571391206 | -0.983 | 0 | 0.859 |
| 4.633849164044795 | -0.985 | 0 | 0.869 |
| 4.636990756698386 | -0.986 | 0 | 0.879 |
| 4.640132349351975 | -0.987 | 0 | 0.888 |
| 4.643273942005564 | -0.988 | 0 | 0.897 |
| 4.646415534659154 | -0.989 | 0 | 0.906 |
| 4.649557127312744 | -0.99 | 0 | 0.915 |
| 4.652698719966334 | -0.991 | 0 | 0.923 |
| 4.655840312619923 | -0.992 | 0 | 0.93 |
| 4.658981905273513 | -0.993 | 0 | 0.938 |
| 4.662123497927102 | -0.994 | 0 | 0.945 |
| 4.665265090580692 | -0.994 | 0 | 0.951 |
| 4.668406683234282 | -0.995 | 0 | 0.957 |
| 4.671548275887871 | -0.996 | 0 | 0.963 |
| 4.674689868541461 | -0.996 | 0 | 0.968 |
| 4.67783146119505 | -0.997 | 0 | 0.973 |
| 4.68097305384864 | -0.998 | 0 | 0.978 |
| 4.68411464650223 | -0.998 | 0 | 0.982 |
| 4.687256239155819 | -0.998 | 0 | 0.986 |
| 4.690397831809409 | -0.999 | 0 | 0.989 |
| 4.693539424462998 | -0.999 | 0 | 0.992 |
| 4.696681017116588 | -0.999 | 0 | 0.994 |
| 4.699822609770177 | -1 | 0 | 0.996 |
| 4.702964202423767 | -1 | 0 | 0.998 |
| 4.706105795077356 | -1 | 0 | 0.999 |
| 4.709247387730946 | -1 | 0 | 1 |
| 4.712388980384535 | -1 | 0 | 1 |
| 4.715530573038126 | -1 | 0 | 1 |
| 4.718672165691715 | -1 | 0 | 0.999 |
| 4.721813758345305 | -1 | 0 | 0.998 |
| 4.724955350998894 | -1 | 0 | 0.996 |
| 4.728096943652484 | -0.999 | 0 | 0.994 |
| 4.731238536306074 | -0.999 | 0 | 0.992 |
| 4.734380128959663 | -0.999 | 0 | 0.989 |
| 4.737521721613253 | -0.998 | 0 | 0.986 |
| 4.740663314266842 | -0.998 | 0 | 0.982 |
| 4.743804906920432 | -0.998 | 0 | 0.978 |
| 4.74694649957402 | -0.997 | 0 | 0.973 |
| 4.750088092227611 | -0.996 | 0 | 0.968 |
| 4.7532296848812 | -0.996 | 0 | 0.963 |
| 4.75637127753479 | -0.995 | 0 | 0.957 |
| 4.75951287018838 | -0.994 | 0 | 0.951 |
| 4.76265446284197 | -0.994 | 0 | 0.945 |
| 4.765796055495559 | -0.993 | 0 | 0.938 |
| 4.768937648149149 | -0.992 | 0 | 0.93 |
| 4.772079240802738 | -0.991 | 0 | 0.923 |
| 4.775220833456327 | -0.99 | 0 | 0.915 |
| 4.778362426109917 | -0.989 | 0 | 0.906 |
| 4.781504018763507 | -0.988 | 0 | 0.897 |
| 4.784645611417097 | -0.987 | 0 | 0.888 |
| 4.787787204070686 | -0.986 | 0 | 0.879 |
| 4.790928796724275 | -0.985 | 0 | 0.869 |
| 4.794070389377865 | -0.983 | 0 | 0.859 |
| 4.797211982031455 | -0.982 | 0 | 0.849 |
| 4.800353574685045 | -0.981 | 0 | 0.838 |
| 4.803495167338634 | -0.979 | 0 | 0.828 |
| 4.806636759992224 | -0.978 | 0 | 0.817 |
| 4.809778352645814 | -0.977 | 0 | 0.805 |
| 4.812919945299403 | -0.975 | 0 | 0.794 |
| 4.816061537952993 | -0.973 | 0 | 0.782 |
| 4.819203130606582 | -0.972 | 0 | 0.77 |
| 4.822344723260172 | -0.97 | 0 | 0.758 |
| 4.825486315913761 | -0.968 | -0.001 | 0.746 |
| 4.828627908567351 | -0.967 | -0.001 | 0.733 |
| 4.83176950122094 | -0.965 | -0.001 | 0.721 |
| 4.83491109387453 | -0.963 | -0.001 | 0.708 |
| 4.83805268652812 | -0.961 | -0.001 | 0.695 |
| 4.841194279181709 | -0.959 | -0.001 | 0.682 |
| 4.844335871835299 | -0.957 | -0.001 | 0.669 |
| 4.847477464488889 | -0.955 | -0.001 | 0.655 |
| 4.850619057142478 | -0.953 | -0.002 | 0.642 |
| 4.853760649796068 | -0.951 | -0.002 | 0.629 |
| 4.856902242449657 | -0.949 | -0.002 | 0.615 |
| 4.860043835103247 | -0.947 | -0.002 | 0.602 |
| 4.863185427756837 | -0.945 | -0.002 | 0.589 |
| 4.866327020410426 | -0.942 | -0.003 | 0.575 |
| 4.869468613064015 | -0.94 | -0.003 | 0.562 |
| 4.872610205717605 | -0.938 | -0.003 | 0.548 |
| 4.875751798371195 | -0.935 | -0.003 | 0.535 |
| 4.878893391024784 | -0.933 | -0.004 | 0.521 |
| 4.882034983678374 | -0.93 | -0.004 | 0.508 |
| 4.885176576331964 | -0.928 | -0.004 | 0.495 |
| 4.888318168985553 | -0.925 | -0.005 | 0.481 |
| 4.891459761639143 | -0.923 | -0.005 | 0.468 |
| 4.894601354292733 | -0.92 | -0.006 | 0.455 |
| 4.897742946946322 | -0.917 | -0.006 | 0.442 |
| 4.900884539599912 | -0.915 | -0.007 | 0.429 |
| 4.904026132253501 | -0.912 | -0.007 | 0.416 |
| 4.907167724907091 | -0.909 | -0.008 | 0.404 |
| 4.91030931756068 | -0.906 | -0.009 | 0.391 |
| 4.91345091021427 | -0.903 | -0.009 | 0.379 |
| 4.91659250286786 | -0.9 | -0.01 | 0.367 |
| 4.91973409552145 | -0.897 | -0.011 | 0.355 |
| 4.922875688175039 | -0.894 | -0.011 | 0.343 |
| 4.926017280828628 | -0.891 | -0.012 | 0.331 |
| 4.929158873482218 | -0.888 | -0.013 | 0.319 |
| 4.932300466135808 | -0.885 | -0.014 | 0.308 |
| 4.935442058789397 | -0.882 | -0.015 | 0.297 |
| 4.938583651442987 | -0.879 | -0.016 | 0.286 |
| 4.941725244096576 | -0.876 | -0.017 | 0.275 |
| 4.944866836750166 | -0.873 | -0.018 | 0.265 |
| 4.948008429403755 | -0.869 | -0.019 | 0.254 |
| 4.951150022057345 | -0.866 | -0.021 | 0.244 |
| 4.954291614710935 | -0.863 | -0.022 | 0.234 |
| 4.957433207364524 | -0.859 | -0.023 | 0.225 |
| 4.960574800018114 | -0.856 | -0.024 | 0.215 |
| 4.963716392671704 | -0.852 | -0.026 | 0.206 |
| 4.966857985325293 | -0.849 | -0.027 | 0.197 |
| 4.969999577978883 | -0.846 | -0.029 | 0.188 |
| 4.973141170632472 | -0.842 | -0.031 | 0.18 |
| 4.976282763286062 | -0.838 | -0.032 | 0.171 |
| 4.979424355939651 | -0.835 | -0.034 | 0.163 |
| 4.982565948593241 | -0.831 | -0.036 | 0.155 |
| 4.985707541246831 | -0.828 | -0.038 | 0.148 |
| 4.98884913390042 | -0.824 | -0.04 | 0.14 |
| 4.99199072655401 | -0.82 | -0.042 | 0.133 |
| 4.9951323192076 | -0.817 | -0.044 | 0.126 |
| 4.99827391186119 | -0.813 | -0.046 | 0.12 |
| 5.00141550451478 | -0.809 | -0.049 | 0.113 |
| 5.004557097168369 | -0.805 | -0.051 | 0.107 |
| 5.007698689821958 | -0.802 | -0.054 | 0.101 |
| 5.010840282475548 | -0.798 | -0.056 | 0.096 |
| 5.013981875129137 | -0.794 | -0.059 | 0.09 |
| 5.017123467782727 | -0.79 | -0.061 | 0.085 |
| 5.020265060436317 | -0.786 | -0.064 | 0.08 |
| 5.023406653089906 | -0.782 | -0.067 | 0.075 |
| 5.026548245743496 | -0.778 | -0.07 | 0.07 |
| 5.029689838397085 | -0.774 | -0.073 | 0.066 |
| 5.032831431050674 | -0.77 | -0.076 | 0.061 |
| 5.035973023704264 | -0.766 | -0.08 | 0.057 |
| 5.039114616357854 | -0.762 | -0.083 | 0.054 |
| 5.042256209011444 | -0.758 | -0.086 | 0.05 |
| 5.045397801665033 | -0.754 | -0.09 | 0.046 |
| 5.048539394318622 | -0.75 | -0.094 | 0.043 |
| 5.051680986972213 | -0.746 | -0.097 | 0.04 |
| 5.054822579625802 | -0.742 | -0.101 | 0.037 |
| 5.057964172279392 | -0.737 | -0.105 | 0.034 |
| 5.061105764932981 | -0.733 | -0.109 | 0.032 |
| 5.064247357586571 | -0.729 | -0.113 | 0.029 |
| 5.067388950240161 | -0.725 | -0.118 | 0.027 |
| 5.07053054289375 | -0.721 | -0.122 | 0.024 |
| 5.07367213554734 | -0.716 | -0.126 | 0.022 |
| 5.07681372820093 | -0.712 | -0.131 | 0.021 |
| 5.079955320854519 | -0.708 | -0.136 | 0.019 |
| 5.083096913508108 | -0.703 | -0.14 | 0.017 |
| 5.086238506161698 | -0.699 | -0.145 | 0.015 |
| 5.089380098815288 | -0.695 | -0.15 | 0.014 |
| 5.092521691468877 | -0.691 | -0.155 | 0.013 |
| 5.095663284122466 | -0.686 | -0.161 | 0.011 |
| 5.098804876776057 | -0.682 | -0.166 | 0.01 |
| 5.101946469429646 | -0.677 | -0.171 | 0.009 |
| 5.105088062083236 | -0.673 | -0.177 | 0.008 |
| 5.108229654736825 | -0.669 | -0.182 | 0.007 |
| 5.111371247390415 | -0.664 | -0.188 | 0.006 |
| 5.114512840044005 | -0.66 | -0.194 | 0.006 |
| 5.117654432697594 | -0.655 | -0.2 | 0.005 |
| 5.120796025351184 | -0.651 | -0.206 | 0.004 |
| 5.123937618004773 | -0.647 | -0.212 | 0.004 |
| 5.127079210658363 | -0.642 | -0.218 | 0.003 |
| 5.130220803311953 | -0.638 | -0.225 | 0.003 |
| 5.133362395965542 | -0.633 | -0.231 | 0.003 |
| 5.136503988619131 | -0.629 | -0.237 | 0.002 |
| 5.13964558127272 | -0.624 | -0.244 | 0.002 |
| 5.142787173926311 | -0.62 | -0.251 | 0.002 |
| 5.1459287665799 | -0.615 | -0.258 | 0.001 |
| 5.14907035923349 | -0.611 | -0.265 | 0.001 |
| 5.15221195188708 | -0.606 | -0.272 | 0.001 |
| 5.15535354454067 | -0.602 | -0.279 | 0.001 |
| 5.158495137194259 | -0.598 | -0.286 | 0.001 |
| 5.161636729847848 | -0.593 | -0.293 | 0.001 |
| 5.164778322501438 | -0.589 | -0.301 | 0 |
| 5.167919915155028 | -0.584 | -0.308 | 0 |
| 5.171061507808617 | -0.58 | -0.316 | 0 |
| 5.174203100462206 | -0.575 | -0.323 | 0 |
| 5.177344693115796 | -0.571 | -0.331 | 0 |
| 5.180486285769386 | -0.566 | -0.339 | 0 |
| 5.183627878422976 | -0.562 | -0.347 | 0 |
| 5.186769471076565 | -0.557 | -0.355 | 0 |
| 5.189911063730155 | -0.553 | -0.363 | 0 |
| 5.193052656383744 | -0.548 | -0.371 | 0 |
| 5.196194249037334 | -0.544 | -0.379 | 0 |
| 5.199335841690924 | -0.539 | -0.387 | 0 |
| 5.202477434344513 | -0.535 | -0.395 | 0 |
| 5.205619026998103 | -0.53 | -0.404 | 0 |
| 5.208760619651692 | -0.526 | -0.412 | 0 |
| 5.211902212305282 | -0.521 | -0.421 | 0 |
| 5.215043804958871 | -0.517 | -0.429 | 0 |
| 5.218185397612461 | -0.512 | -0.438 | 0 |
| 5.221326990266051 | -0.508 | -0.446 | 0 |
| 5.22446858291964 | -0.503 | -0.455 | 0 |
| 5.22761017557323 | -0.499 | -0.464 | 0 |
| 5.23075176822682 | -0.495 | -0.472 | 0 |
| 5.23389336088041 | -0.49 | -0.481 | 0 |
| 5.237034953533999 | -0.486 | -0.49 | 0 |
| 5.240176546187588 | -0.481 | -0.499 | 0 |
| 5.243318138841178 | -0.477 | -0.508 | 0 |
| 5.246459731494767 | -0.472 | -0.517 | 0 |
| 5.249601324148357 | -0.468 | -0.526 | 0 |
| 5.252742916801947 | -0.464 | -0.535 | 0 |
| 5.255884509455536 | -0.459 | -0.544 | 0 |
| 5.259026102109125 | -0.455 | -0.553 | 0 |
| 5.262167694762715 | -0.451 | -0.562 | 0 |
| 5.265309287416305 | -0.446 | -0.571 | 0 |
| 5.268450880069895 | -0.442 | -0.58 | 0 |
| 5.271592472723484 | -0.438 | -0.589 | 0 |
| 5.274734065377074 | -0.433 | -0.598 | 0 |
| 5.277875658030664 | -0.429 | -0.606 | 0 |
| 5.281017250684253 | -0.425 | -0.615 | 0 |
| 5.284158843337843 | -0.421 | -0.624 | 0 |
| 5.287300435991432 | -0.416 | -0.633 | 0 |
| 5.290442028645022 | -0.412 | -0.642 | 0 |
| 5.293583621298612 | -0.408 | -0.651 | 0 |
| 5.296725213952201 | -0.404 | -0.66 | 0 |
| 5.299866806605791 | -0.399 | -0.669 | 0 |
| 5.30300839925938 | -0.395 | -0.677 | 0 |
| 5.30614999191297 | -0.391 | -0.686 | 0 |
| 5.30929158456656 | -0.387 | -0.695 | 0 |
| 5.312433177220149 | -0.383 | -0.703 | -0.001 |
| 5.315574769873739 | -0.379 | -0.712 | -0.001 |
| 5.318716362527328 | -0.375 | -0.721 | -0.001 |
| 5.321857955180918 | -0.371 | -0.729 | -0.001 |
| 5.324999547834508 | -0.367 | -0.737 | -0.001 |
| 5.328141140488097 | -0.363 | -0.746 | -0.002 |
| 5.331282733141686 | -0.359 | -0.754 | -0.002 |
| 5.334424325795276 | -0.355 | -0.762 | -0.002 |
| 5.337565918448866 | -0.351 | -0.77 | -0.002 |
| 5.340707511102456 | -0.347 | -0.778 | -0.003 |
| 5.343849103756045 | -0.343 | -0.786 | -0.003 |
| 5.346990696409634 | -0.339 | -0.794 | -0.004 |
| 5.350132289063224 | -0.335 | -0.802 | -0.004 |
| 5.353273881716814 | -0.331 | -0.809 | -0.005 |
| 5.356415474370403 | -0.327 | -0.817 | -0.006 |
| 5.359557067023993 | -0.323 | -0.824 | -0.006 |
| 5.362698659677583 | -0.319 | -0.831 | -0.007 |
| 5.365840252331172 | -0.316 | -0.838 | -0.008 |
| 5.368981844984762 | -0.312 | -0.846 | -0.009 |
| 5.372123437638351 | -0.308 | -0.852 | -0.01 |
| 5.375265030291941 | -0.304 | -0.859 | -0.011 |
| 5.378406622945531 | -0.301 | -0.866 | -0.012 |
| 5.38154821559912 | -0.297 | -0.873 | -0.014 |
| 5.38468980825271 | -0.293 | -0.879 | -0.015 |
| 5.387831400906299 | -0.29 | -0.885 | -0.016 |
| 5.39097299355989 | -0.286 | -0.891 | -0.018 |
| 5.394114586213479 | -0.282 | -0.897 | -0.02 |
| 5.397256178867068 | -0.279 | -0.903 | -0.022 |
| 5.400397771520657 | -0.275 | -0.909 | -0.024 |
| 5.403539364174247 | -0.272 | -0.915 | -0.026 |
| 5.406680956827837 | -0.268 | -0.92 | -0.028 |
| 5.409822549481426 | -0.265 | -0.925 | -0.031 |
| 5.412964142135016 | -0.261 | -0.93 | -0.033 |
| 5.416105734788605 | -0.258 | -0.935 | -0.036 |
| 5.419247327442195 | -0.254 | -0.94 | -0.039 |
| 5.422388920095785 | -0.251 | -0.945 | -0.042 |
| 5.425530512749375 | -0.247 | -0.949 | -0.045 |
| 5.428672105402964 | -0.244 | -0.953 | -0.049 |
| 5.431813698056554 | -0.241 | -0.957 | -0.052 |
| 5.434955290710143 | -0.237 | -0.961 | -0.056 |
| 5.438096883363733 | -0.234 | -0.965 | -0.06 |
| 5.441238476017322 | -0.231 | -0.968 | -0.064 |
| 5.444380068670912 | -0.228 | -0.972 | -0.069 |
| 5.447521661324502 | -0.225 | -0.975 | -0.073 |
| 5.450663253978091 | -0.221 | -0.978 | -0.078 |
| 5.453804846631681 | -0.218 | -0.981 | -0.083 |
| 5.456946439285271 | -0.215 | -0.983 | -0.088 |
| 5.46008803193886 | -0.212 | -0.986 | -0.094 |
| 5.46322962459245 | -0.209 | -0.988 | -0.099 |
| 5.466371217246039 | -0.206 | -0.99 | -0.105 |
| 5.46951280989963 | -0.203 | -0.992 | -0.111 |
| 5.472654402553218 | -0.2 | -0.994 | -0.118 |
| 5.475795995206808 | -0.197 | -0.995 | -0.124 |
| 5.478937587860398 | -0.194 | -0.996 | -0.131 |
| 5.482079180513987 | -0.191 | -0.998 | -0.138 |
| 5.485220773167577 | -0.188 | -0.998 | -0.145 |
| 5.488362365821166 | -0.185 | -0.999 | -0.153 |
| 5.491503958474756 | -0.182 | -1 | -0.161 |
| 5.494645551128346 | -0.18 | -1 | -0.169 |
| 5.497787143781935 | -0.177 | -1 | -0.177 |
| 5.500928736435525 | -0.174 | -1 | -0.185 |
| 5.504070329089115 | -0.171 | -1 | -0.194 |
| 5.507211921742704 | -0.169 | -0.999 | -0.203 |
| 5.510353514396294 | -0.166 | -0.998 | -0.212 |
| 5.513495107049883 | -0.163 | -0.998 | -0.221 |
| 5.516636699703473 | -0.161 | -0.996 | -0.231 |
| 5.519778292357062 | -0.158 | -0.995 | -0.241 |
| 5.522919885010652 | -0.155 | -0.994 | -0.251 |
| 5.526061477664242 | -0.153 | -0.992 | -0.261 |
| 5.529203070317831 | -0.15 | -0.99 | -0.272 |
| 5.532344662971421 | -0.148 | -0.988 | -0.282 |
| 5.535486255625011 | -0.145 | -0.986 | -0.293 |
| 5.5386278482786 | -0.143 | -0.983 | -0.304 |
| 5.54176944093219 | -0.14 | -0.981 | -0.316 |
| 5.544911033585779 | -0.138 | -0.978 | -0.327 |
| 5.54805262623937 | -0.136 | -0.975 | -0.339 |
| 5.551194218892959 | -0.133 | -0.972 | -0.351 |
| 5.554335811546548 | -0.131 | -0.968 | -0.363 |
| 5.557477404200137 | -0.129 | -0.965 | -0.375 |
| 5.560618996853727 | -0.126 | -0.961 | -0.387 |
| 5.563760589507317 | -0.124 | -0.957 | -0.399 |
| 5.566902182160906 | -0.122 | -0.953 | -0.412 |
| 5.570043774814496 | -0.12 | -0.949 | -0.425 |
| 5.573185367468086 | -0.118 | -0.945 | -0.438 |
| 5.576326960121675 | -0.116 | -0.94 | -0.451 |
| 5.579468552775264 | -0.113 | -0.935 | -0.464 |
| 5.582610145428854 | -0.111 | -0.93 | -0.477 |
| 5.585751738082444 | -0.109 | -0.925 | -0.49 |
| 5.588893330736034 | -0.107 | -0.92 | -0.503 |
| 5.592034923389623 | -0.105 | -0.915 | -0.517 |
| 5.595176516043213 | -0.103 | -0.909 | -0.53 |
| 5.598318108696803 | -0.101 | -0.903 | -0.544 |
| 5.601459701350392 | -0.099 | -0.897 | -0.557 |
| 5.604601294003982 | -0.097 | -0.891 | -0.571 |
| 5.607742886657571 | -0.096 | -0.885 | -0.584 |
| 5.610884479311161 | -0.094 | -0.879 | -0.598 |
| 5.61402607196475 | -0.092 | -0.873 | -0.611 |
| 5.61716766461834 | -0.09 | -0.866 | -0.624 |
| 5.62030925727193 | -0.088 | -0.859 | -0.638 |
| 5.623450849925519 | -0.086 | -0.852 | -0.651 |
| 5.626592442579109 | -0.085 | -0.846 | -0.664 |
| 5.629734035232698 | -0.083 | -0.838 | -0.677 |
| 5.632875627886288 | -0.081 | -0.831 | -0.691 |
| 5.636017220539878 | -0.08 | -0.824 | -0.703 |
| 5.639158813193467 | -0.078 | -0.817 | -0.716 |
| 5.642300405847057 | -0.076 | -0.809 | -0.729 |
| 5.645441998500646 | -0.075 | -0.802 | -0.742 |
| 5.648583591154236 | -0.073 | -0.794 | -0.754 |
| 5.651725183807825 | -0.072 | -0.786 | -0.766 |
| 5.654866776461415 | -0.07 | -0.778 | -0.778 |
| 5.658008369115005 | -0.069 | -0.77 | -0.79 |
| 5.661149961768594 | -0.067 | -0.762 | -0.802 |
| 5.664291554422184 | -0.066 | -0.754 | -0.813 |
| 5.667433147075774 | -0.064 | -0.746 | -0.824 |
| 5.670574739729363 | -0.063 | -0.737 | -0.835 |
| 5.673716332382953 | -0.061 | -0.729 | -0.846 |
| 5.676857925036542 | -0.06 | -0.721 | -0.856 |
| 5.679999517690132 | -0.059 | -0.712 | -0.866 |
| 5.683141110343721 | -0.057 | -0.703 | -0.876 |
| 5.686282702997311 | -0.056 | -0.695 | -0.885 |
| 5.689424295650901 | -0.055 | -0.686 | -0.894 |
| 5.69256588830449 | -0.054 | -0.677 | -0.903 |
| 5.69570748095808 | -0.052 | -0.669 | -0.912 |
| 5.69884907361167 | -0.051 | -0.66 | -0.92 |
| 5.701990666265259 | -0.05 | -0.651 | -0.928 |
| 5.705132258918849 | -0.049 | -0.642 | -0.935 |
| 5.708273851572438 | -0.048 | -0.633 | -0.942 |
| 5.711415444226028 | -0.046 | -0.624 | -0.949 |
| 5.714557036879618 | -0.045 | -0.615 | -0.955 |
| 5.717698629533207 | -0.044 | -0.606 | -0.961 |
| 5.720840222186797 | -0.043 | -0.598 | -0.967 |
| 5.723981814840386 | -0.042 | -0.589 | -0.972 |
| 5.727123407493976 | -0.041 | -0.58 | -0.977 |
| 5.730265000147565 | -0.04 | -0.571 | -0.981 |
| 5.733406592801155 | -0.039 | -0.562 | -0.985 |
| 5.736548185454744 | -0.038 | -0.553 | -0.988 |
| 5.739689778108334 | -0.037 | -0.544 | -0.991 |
| 5.742831370761924 | -0.036 | -0.535 | -0.994 |
| 5.745972963415514 | -0.035 | -0.526 | -0.996 |
| 5.749114556069103 | -0.034 | -0.517 | -0.998 |
| 5.752256148722693 | -0.033 | -0.508 | -0.999 |
| 5.755397741376282 | -0.032 | -0.499 | -1 |
| 5.758539334029872 | -0.032 | -0.49 | -1 |
| 5.761680926683462 | -0.031 | -0.481 | -1 |
| 5.764822519337051 | -0.03 | -0.472 | -0.999 |
| 5.767964111990641 | -0.029 | -0.464 | -0.998 |
| 5.77110570464423 | -0.028 | -0.455 | -0.997 |
| 5.77424729729782 | -0.027 | -0.446 | -0.995 |
| 5.77738888995141 | -0.027 | -0.438 | -0.993 |
| 5.780530482605 | -0.026 | -0.429 | -0.99 |
| 5.783672075258588 | -0.025 | -0.421 | -0.987 |
| 5.786813667912178 | -0.024 | -0.412 | -0.983 |
| 5.789955260565768 | -0.024 | -0.404 | -0.979 |
| 5.793096853219358 | -0.023 | -0.395 | -0.975 |
| 5.796238445872947 | -0.022 | -0.387 | -0.97 |
| 5.799380038526537 | -0.022 | -0.379 | -0.965 |
| 5.802521631180126 | -0.021 | -0.371 | -0.959 |
| 5.805663223833715 | -0.021 | -0.363 | -0.953 |
| 5.808804816487306 | -0.02 | -0.355 | -0.947 |
| 5.811946409140895 | -0.019 | -0.347 | -0.94 |
| 5.815088001794485 | -0.019 | -0.339 | -0.933 |
| 5.818229594448074 | -0.018 | -0.331 | -0.925 |
| 5.821371187101663 | -0.018 | -0.323 | -0.917 |
| 5.824512779755254 | -0.017 | -0.316 | -0.909 |
| 5.827654372408843 | -0.016 | -0.308 | -0.9 |
| 5.830795965062433 | -0.016 | -0.301 | -0.891 |
| 5.833937557716022 | -0.015 | -0.293 | -0.882 |
| 5.837079150369612 | -0.015 | -0.286 | -0.873 |
| 5.840220743023201 | -0.014 | -0.279 | -0.863 |
| 5.843362335676791 | -0.014 | -0.272 | -0.852 |
| 5.846503928330381 | -0.014 | -0.265 | -0.842 |
| 5.84964552098397 | -0.013 | -0.258 | -0.831 |
| 5.85278711363756 | -0.013 | -0.251 | -0.82 |
| 5.85592870629115 | -0.012 | -0.244 | -0.809 |
| 5.85907029894474 | -0.012 | -0.237 | -0.798 |
| 5.862211891598329 | -0.011 | -0.231 | -0.786 |
| 5.865353484251918 | -0.011 | -0.225 | -0.774 |
| 5.868495076905508 | -0.011 | -0.218 | -0.762 |
| 5.871636669559098 | -0.01 | -0.212 | -0.75 |
| 5.874778262212687 | -0.01 | -0.206 | -0.737 |
| 5.877919854866277 | -0.01 | -0.2 | -0.725 |
| 5.881061447519866 | -0.009 | -0.194 | -0.712 |
| 5.884203040173456 | -0.009 | -0.188 | -0.699 |
| 5.887344632827046 | -0.009 | -0.182 | -0.686 |
| 5.890486225480635 | -0.008 | -0.177 | -0.673 |
| 5.893627818134224 | -0.008 | -0.171 | -0.66 |
| 5.896769410787814 | -0.008 | -0.166 | -0.647 |
| 5.899911003441404 | -0.007 | -0.161 | -0.633 |
| 5.903052596094994 | -0.007 | -0.155 | -0.62 |
| 5.906194188748583 | -0.007 | -0.15 | -0.606 |
| 5.909335781402172 | -0.006 | -0.145 | -0.593 |
| 5.912477374055762 | -0.006 | -0.14 | -0.58 |
| 5.915618966709352 | -0.006 | -0.136 | -0.566 |
| 5.918760559362942 | -0.006 | -0.131 | -0.553 |
| 5.921902152016531 | -0.006 | -0.126 | -0.539 |
| 5.92504374467012 | -0.005 | -0.122 | -0.526 |
| 5.92818533732371 | -0.005 | -0.118 | -0.512 |
| 5.9313269299773 | -0.005 | -0.113 | -0.499 |
| 5.93446852263089 | -0.005 | -0.109 | -0.486 |
| 5.93761011528448 | -0.004 | -0.105 | -0.472 |
| 5.940751707938068 | -0.004 | -0.101 | -0.459 |
| 5.943893300591658 | -0.004 | -0.097 | -0.446 |
| 5.947034893245248 | -0.004 | -0.094 | -0.433 |
| 5.950176485898837 | -0.004 | -0.09 | -0.421 |
| 5.953318078552427 | -0.004 | -0.086 | -0.408 |
| 5.956459671206017 | -0.003 | -0.083 | -0.395 |
| 5.959601263859606 | -0.003 | -0.08 | -0.383 |
| 5.962742856513196 | -0.003 | -0.076 | -0.371 |
| 5.965884449166785 | -0.003 | -0.073 | -0.359 |
| 5.969026041820375 | -0.003 | -0.07 | -0.347 |
| 5.972167634473964 | -0.003 | -0.067 | -0.335 |
| 5.975309227127554 | -0.003 | -0.064 | -0.323 |
| 5.978450819781144 | -0.002 | -0.061 | -0.312 |
| 5.981592412434733 | -0.002 | -0.059 | -0.301 |
| 5.984734005088323 | -0.002 | -0.056 | -0.29 |
| 5.987875597741913 | -0.002 | -0.054 | -0.279 |
| 5.991017190395502 | -0.002 | -0.051 | -0.268 |
| 5.994158783049092 | -0.002 | -0.049 | -0.258 |
| 5.997300375702681 | -0.002 | -0.046 | -0.247 |
| 6.000441968356271 | -0.002 | -0.044 | -0.237 |
| 6.003583561009861 | -0.002 | -0.042 | -0.228 |
| 6.00672515366345 | -0.002 | -0.04 | -0.218 |
| 6.00986674631704 | -0.001 | -0.038 | -0.209 |
| 6.01300833897063 | -0.001 | -0.036 | -0.2 |
| 6.01614993162422 | -0.001 | -0.034 | -0.191 |
| 6.019291524277808 | -0.001 | -0.032 | -0.182 |
| 6.022433116931398 | -0.001 | -0.031 | -0.174 |
| 6.025574709584988 | -0.001 | -0.029 | -0.166 |
| 6.028716302238577 | -0.001 | -0.027 | -0.158 |
| 6.031857894892167 | -0.001 | -0.026 | -0.15 |
| 6.034999487545757 | -0.001 | -0.024 | -0.143 |
| 6.038141080199346 | -0.001 | -0.023 | -0.136 |
| 6.041282672852935 | -0.001 | -0.022 | -0.129 |
| 6.044424265506525 | -0.001 | -0.021 | -0.122 |
| 6.047565858160115 | -0.001 | -0.019 | -0.116 |
| 6.050707450813704 | -0.001 | -0.018 | -0.109 |
| 6.053849043467294 | -0.001 | -0.017 | -0.103 |
| 6.056990636120884 | -0.001 | -0.016 | -0.097 |
| 6.060132228774473 | -0.001 | -0.015 | -0.092 |
| 6.063273821428063 | 0 | -0.014 | -0.086 |
| 6.066415414081653 | 0 | -0.013 | -0.081 |
| 6.069557006735242 | 0 | -0.012 | -0.076 |
| 6.072698599388831 | 0 | -0.011 | -0.072 |
| 6.07584019204242 | 0 | -0.011 | -0.067 |
| 6.078981784696011 | 0 | -0.01 | -0.063 |
| 6.082123377349601 | 0 | -0.009 | -0.059 |
| 6.08526497000319 | 0 | -0.009 | -0.055 |
| 6.08840656265678 | 0 | -0.008 | -0.051 |
| 6.09154815531037 | 0 | -0.007 | -0.048 |
| 6.094689747963959 | 0 | -0.007 | -0.044 |
| 6.097831340617549 | 0 | -0.006 | -0.041 |
| 6.100972933271138 | 0 | -0.006 | -0.038 |
| 6.104114525924728 | 0 | -0.005 | -0.035 |
| 6.107256118578317 | 0 | -0.005 | -0.032 |
| 6.110397711231907 | 0 | -0.004 | -0.03 |
| 6.113539303885497 | 0 | -0.004 | -0.027 |
| 6.116680896539086 | 0 | -0.004 | -0.025 |
| 6.119822489192675 | 0 | -0.003 | -0.023 |
| 6.122964081846265 | 0 | -0.003 | -0.021 |
| 6.126105674499855 | 0 | -0.003 | -0.019 |
| 6.129247267153445 | 0 | -0.003 | -0.018 |
| 6.132388859807034 | 0 | -0.002 | -0.016 |
| 6.135530452460624 | 0 | -0.002 | -0.014 |
| 6.138672045114213 | 0 | -0.002 | -0.013 |
| 6.141813637767803 | 0 | -0.002 | -0.012 |
| 6.144955230421393 | 0 | -0.002 | -0.011 |
| 6.148096823074982 | 0 | -0.001 | -0.01 |
| 6.151238415728571 | 0 | -0.001 | -0.009 |
| 6.154380008382161 | 0 | -0.001 | -0.008 |
| 6.157521601035751 | 0 | -0.001 | -0.007 |
| 6.16066319368934 | 0 | -0.001 | -0.006 |
| 6.16380478634293 | 0 | -0.001 | -0.005 |
| 6.16694637899652 | 0 | -0.001 | -0.005 |
| 6.170087971650109 | 0 | -0.001 | -0.004 |
| 6.173229564303698 | 0 | 0 | -0.004 |
| 6.176371156957289 | 0 | 0 | -0.003 |
| 6.179512749610878 | 0 | 0 | -0.003 |
| 6.182654342264468 | 0 | 0 | -0.002 |
| 6.185795934918057 | 0 | 0 | -0.002 |
| 6.188937527571647 | 0 | 0 | -0.002 |
| 6.192079120225237 | 0 | 0 | -0.001 |
| 6.195220712878826 | 0 | 0 | -0.001 |
| 6.198362305532415 | 0 | 0 | -0.001 |
| 6.201503898186005 | 0 | 0 | -0.001 |
| 6.204645490839594 | 0 | 0 | -0.001 |
| 6.207787083493184 | 0 | 0 | -0.001 |
| 6.210928676146774 | 0 | 0 | 0 |
| 6.214070268800364 | 0 | 0 | 0 |
| 6.217211861453953 | 0 | 0 | 0 |
| 6.220353454107543 | 0 | 0 | 0 |
| 6.223495046761133 | 0 | 0 | 0 |
| 6.226636639414722 | 0 | 0 | 0 |
| 6.229778232068312 | 0 | 0 | 0 |
| 6.232919824721901 | 0 | 0 | 0 |
| 6.236061417375491 | 0 | 0 | 0 |
| 6.23920301002908 | 0 | 0 | 0 |
| 6.24234460268267 | 0 | 0 | 0 |
| 6.24548619533626 | 0 | 0 | 0 |
| 6.24862778798985 | 0 | 0 | 0 |
| 6.251769380643438 | 0 | 0 | 0 |
| 6.254910973297028 | 0 | 0 | 0 |
| 6.258052565950618 | 0 | 0 | 0 |
| 6.261194158604208 | 0 | 0 | 0 |
| 6.264335751257797 | 0 | 0 | 0 |
| 6.267477343911387 | 0 | 0 | 0 |
| 6.270618936564976 | 0 | 0 | 0 |
| 6.273760529218566 | 0 | 0 | 0 |
| 6.276902121872155 | 0 | 0 | 0 |
| 6.280043714525745 | 0 | 0 | 0 |
| 6.283185307179335 | 0 | 0 | 0 |